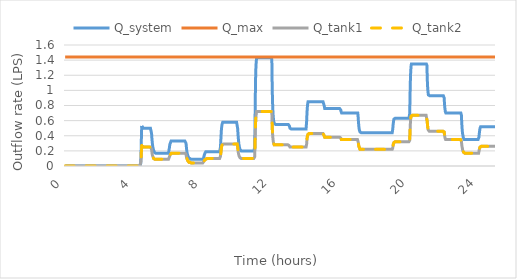
| Category | Q_system | Q_max | Q_tank1 | Q_tank2 |
|---|---|---|---|---|
| 0.0 | 0 | 1.44 | 0 | 0 |
| 0.016666666666666666 | 0 | 1.44 | 0 | 0 |
| 0.03333333333333333 | 0 | 1.44 | 0 | 0 |
| 0.05 | 0 | 1.44 | 0 | 0 |
| 0.06666666666666667 | 0 | 1.44 | 0 | 0 |
| 0.08333333333333333 | 0 | 1.44 | 0 | 0 |
| 0.09999999999999999 | 0 | 1.44 | 0 | 0 |
| 0.11666666666666665 | 0 | 1.44 | 0 | 0 |
| 0.13333333333333333 | 0 | 1.44 | 0 | 0 |
| 0.15 | 0 | 1.44 | 0 | 0 |
| 0.16666666666666666 | 0 | 1.44 | 0 | 0 |
| 0.18333333333333332 | 0 | 1.44 | 0 | 0 |
| 0.19999999999999998 | 0 | 1.44 | 0 | 0 |
| 0.21666666666666665 | 0 | 1.44 | 0 | 0 |
| 0.2333333333333333 | 0 | 1.44 | 0 | 0 |
| 0.24999999999999997 | 0 | 1.44 | 0 | 0 |
| 0.26666666666666666 | 0 | 1.44 | 0 | 0 |
| 0.2833333333333333 | 0 | 1.44 | 0 | 0 |
| 0.3 | 0 | 1.44 | 0 | 0 |
| 0.31666666666666665 | 0 | 1.44 | 0 | 0 |
| 0.3333333333333333 | 0 | 1.44 | 0 | 0 |
| 0.35 | 0 | 1.44 | 0 | 0 |
| 0.36666666666666664 | 0 | 1.44 | 0 | 0 |
| 0.3833333333333333 | 0 | 1.44 | 0 | 0 |
| 0.39999999999999997 | 0 | 1.44 | 0 | 0 |
| 0.41666666666666663 | 0 | 1.44 | 0 | 0 |
| 0.4333333333333333 | 0 | 1.44 | 0 | 0 |
| 0.44999999999999996 | 0 | 1.44 | 0 | 0 |
| 0.4666666666666666 | 0 | 1.44 | 0 | 0 |
| 0.4833333333333333 | 0 | 1.44 | 0 | 0 |
| 0.49999999999999994 | 0 | 1.44 | 0 | 0 |
| 0.5166666666666666 | 0 | 1.44 | 0 | 0 |
| 0.5333333333333333 | 0 | 1.44 | 0 | 0 |
| 0.55 | 0 | 1.44 | 0 | 0 |
| 0.5666666666666668 | 0 | 1.44 | 0 | 0 |
| 0.5833333333333335 | 0 | 1.44 | 0 | 0 |
| 0.6000000000000002 | 0 | 1.44 | 0 | 0 |
| 0.6166666666666669 | 0 | 1.44 | 0 | 0 |
| 0.6333333333333336 | 0 | 1.44 | 0 | 0 |
| 0.6500000000000004 | 0 | 1.44 | 0 | 0 |
| 0.6666666666666671 | 0 | 1.44 | 0 | 0 |
| 0.6833333333333338 | 0 | 1.44 | 0 | 0 |
| 0.7000000000000005 | 0 | 1.44 | 0 | 0 |
| 0.7166666666666672 | 0 | 1.44 | 0 | 0 |
| 0.733333333333334 | 0 | 1.44 | 0 | 0 |
| 0.7500000000000007 | 0 | 1.44 | 0 | 0 |
| 0.7666666666666674 | 0 | 1.44 | 0 | 0 |
| 0.7833333333333341 | 0 | 1.44 | 0 | 0 |
| 0.8000000000000008 | 0 | 1.44 | 0 | 0 |
| 0.8166666666666675 | 0 | 1.44 | 0 | 0 |
| 0.8333333333333343 | 0 | 1.44 | 0 | 0 |
| 0.850000000000001 | 0 | 1.44 | 0 | 0 |
| 0.8666666666666677 | 0 | 1.44 | 0 | 0 |
| 0.8833333333333344 | 0 | 1.44 | 0 | 0 |
| 0.9000000000000011 | 0 | 1.44 | 0 | 0 |
| 0.9166666666666679 | 0 | 1.44 | 0 | 0 |
| 0.9333333333333346 | 0 | 1.44 | 0 | 0 |
| 0.9500000000000013 | 0 | 1.44 | 0 | 0 |
| 0.966666666666668 | 0 | 1.44 | 0 | 0 |
| 0.9833333333333347 | 0 | 1.44 | 0 | 0 |
| 1.0000000000000013 | 0 | 1.44 | 0 | 0 |
| 1.016666666666668 | 0 | 1.44 | 0 | 0 |
| 1.0333333333333345 | 0 | 1.44 | 0 | 0 |
| 1.0500000000000012 | 0 | 1.44 | 0 | 0 |
| 1.0666666666666678 | 0 | 1.44 | 0 | 0 |
| 1.0833333333333344 | 0 | 1.44 | 0 | 0 |
| 1.100000000000001 | 0 | 1.44 | 0 | 0 |
| 1.1166666666666676 | 0 | 1.44 | 0 | 0 |
| 1.1333333333333342 | 0 | 1.44 | 0 | 0 |
| 1.1500000000000008 | 0 | 1.44 | 0 | 0 |
| 1.1666666666666674 | 0 | 1.44 | 0 | 0 |
| 1.183333333333334 | 0 | 1.44 | 0 | 0 |
| 1.2000000000000006 | 0 | 1.44 | 0 | 0 |
| 1.2166666666666672 | 0 | 1.44 | 0 | 0 |
| 1.2333333333333338 | 0 | 1.44 | 0 | 0 |
| 1.2500000000000004 | 0 | 1.44 | 0 | 0 |
| 1.266666666666667 | 0 | 1.44 | 0 | 0 |
| 1.2833333333333337 | 0 | 1.44 | 0 | 0 |
| 1.3000000000000003 | 0 | 1.44 | 0 | 0 |
| 1.3166666666666669 | 0 | 1.44 | 0 | 0 |
| 1.3333333333333335 | 0 | 1.44 | 0 | 0 |
| 1.35 | 0 | 1.44 | 0 | 0 |
| 1.3666666666666667 | 0 | 1.44 | 0 | 0 |
| 1.3833333333333333 | 0 | 1.44 | 0 | 0 |
| 1.4 | 0 | 1.44 | 0 | 0 |
| 1.4166666666666665 | 0 | 1.44 | 0 | 0 |
| 1.4333333333333331 | 0 | 1.44 | 0 | 0 |
| 1.4499999999999997 | 0 | 1.44 | 0 | 0 |
| 1.4666666666666663 | 0 | 1.44 | 0 | 0 |
| 1.483333333333333 | 0 | 1.44 | 0 | 0 |
| 1.4999999999999996 | 0 | 1.44 | 0 | 0 |
| 1.5166666666666662 | 0 | 1.44 | 0 | 0 |
| 1.5333333333333328 | 0 | 1.44 | 0 | 0 |
| 1.5499999999999994 | 0 | 1.44 | 0 | 0 |
| 1.566666666666666 | 0 | 1.44 | 0 | 0 |
| 1.5833333333333326 | 0 | 1.44 | 0 | 0 |
| 1.5999999999999992 | 0 | 1.44 | 0 | 0 |
| 1.6166666666666658 | 0 | 1.44 | 0 | 0 |
| 1.6333333333333324 | 0 | 1.44 | 0 | 0 |
| 1.649999999999999 | 0 | 1.44 | 0 | 0 |
| 1.6666666666666656 | 0 | 1.44 | 0 | 0 |
| 1.6833333333333322 | 0 | 1.44 | 0 | 0 |
| 1.6999999999999988 | 0 | 1.44 | 0 | 0 |
| 1.7166666666666655 | 0 | 1.44 | 0 | 0 |
| 1.733333333333332 | 0 | 1.44 | 0 | 0 |
| 1.7499999999999987 | 0 | 1.44 | 0 | 0 |
| 1.7666666666666653 | 0 | 1.44 | 0 | 0 |
| 1.7833333333333319 | 0 | 1.44 | 0 | 0 |
| 1.7999999999999985 | 0 | 1.44 | 0 | 0 |
| 1.816666666666665 | 0 | 1.44 | 0 | 0 |
| 1.8333333333333317 | 0 | 1.44 | 0 | 0 |
| 1.8499999999999983 | 0 | 1.44 | 0 | 0 |
| 1.866666666666665 | 0 | 1.44 | 0 | 0 |
| 1.8833333333333315 | 0 | 1.44 | 0 | 0 |
| 1.8999999999999981 | 0 | 1.44 | 0 | 0 |
| 1.9166666666666647 | 0 | 1.44 | 0 | 0 |
| 1.9333333333333313 | 0 | 1.44 | 0 | 0 |
| 1.949999999999998 | 0 | 1.44 | 0 | 0 |
| 1.9666666666666646 | 0 | 1.44 | 0 | 0 |
| 1.9833333333333312 | 0 | 1.44 | 0 | 0 |
| 1.9999999999999978 | 0 | 1.44 | 0 | 0 |
| 2.0166666666666644 | 0 | 1.44 | 0 | 0 |
| 2.033333333333331 | 0 | 1.44 | 0 | 0 |
| 2.0499999999999976 | 0 | 1.44 | 0 | 0 |
| 2.066666666666664 | 0 | 1.44 | 0 | 0 |
| 2.083333333333331 | 0 | 1.44 | 0 | 0 |
| 2.0999999999999974 | 0 | 1.44 | 0 | 0 |
| 2.116666666666664 | 0 | 1.44 | 0 | 0 |
| 2.1333333333333306 | 0 | 1.44 | 0 | 0 |
| 2.1499999999999972 | 0 | 1.44 | 0 | 0 |
| 2.166666666666664 | 0 | 1.44 | 0 | 0 |
| 2.1833333333333305 | 0 | 1.44 | 0 | 0 |
| 2.199999999999997 | 0 | 1.44 | 0 | 0 |
| 2.2166666666666637 | 0 | 1.44 | 0 | 0 |
| 2.2333333333333303 | 0 | 1.44 | 0 | 0 |
| 2.249999999999997 | 0 | 1.44 | 0 | 0 |
| 2.2666666666666635 | 0 | 1.44 | 0 | 0 |
| 2.28333333333333 | 0 | 1.44 | 0 | 0 |
| 2.2999999999999967 | 0 | 1.44 | 0 | 0 |
| 2.3166666666666633 | 0 | 1.44 | 0 | 0 |
| 2.33333333333333 | 0 | 1.44 | 0 | 0 |
| 2.3499999999999965 | 0 | 1.44 | 0 | 0 |
| 2.366666666666663 | 0 | 1.44 | 0 | 0 |
| 2.3833333333333298 | 0 | 1.44 | 0 | 0 |
| 2.3999999999999964 | 0 | 1.44 | 0 | 0 |
| 2.416666666666663 | 0 | 1.44 | 0 | 0 |
| 2.4333333333333296 | 0 | 1.44 | 0 | 0 |
| 2.449999999999996 | 0 | 1.44 | 0 | 0 |
| 2.466666666666663 | 0 | 1.44 | 0 | 0 |
| 2.4833333333333294 | 0 | 1.44 | 0 | 0 |
| 2.499999999999996 | 0 | 1.44 | 0 | 0 |
| 2.5166666666666626 | 0 | 1.44 | 0 | 0 |
| 2.533333333333329 | 0 | 1.44 | 0 | 0 |
| 2.549999999999996 | 0 | 1.44 | 0 | 0 |
| 2.5666666666666624 | 0 | 1.44 | 0 | 0 |
| 2.583333333333329 | 0 | 1.44 | 0 | 0 |
| 2.5999999999999956 | 0 | 1.44 | 0 | 0 |
| 2.6166666666666623 | 0 | 1.44 | 0 | 0 |
| 2.633333333333329 | 0 | 1.44 | 0 | 0 |
| 2.6499999999999955 | 0 | 1.44 | 0 | 0 |
| 2.666666666666662 | 0 | 1.44 | 0 | 0 |
| 2.6833333333333287 | 0 | 1.44 | 0 | 0 |
| 2.6999999999999953 | 0 | 1.44 | 0 | 0 |
| 2.716666666666662 | 0 | 1.44 | 0 | 0 |
| 2.7333333333333285 | 0 | 1.44 | 0 | 0 |
| 2.749999999999995 | 0 | 1.44 | 0 | 0 |
| 2.7666666666666617 | 0 | 1.44 | 0 | 0 |
| 2.7833333333333283 | 0 | 1.44 | 0 | 0 |
| 2.799999999999995 | 0 | 1.44 | 0 | 0 |
| 2.8166666666666615 | 0 | 1.44 | 0 | 0 |
| 2.833333333333328 | 0 | 1.44 | 0 | 0 |
| 2.8499999999999948 | 0 | 1.44 | 0 | 0 |
| 2.8666666666666614 | 0 | 1.44 | 0 | 0 |
| 2.883333333333328 | 0 | 1.44 | 0 | 0 |
| 2.8999999999999946 | 0 | 1.44 | 0 | 0 |
| 2.916666666666661 | 0 | 1.44 | 0 | 0 |
| 2.933333333333328 | 0 | 1.44 | 0 | 0 |
| 2.9499999999999944 | 0 | 1.44 | 0 | 0 |
| 2.966666666666661 | 0 | 1.44 | 0 | 0 |
| 2.9833333333333276 | 0 | 1.44 | 0 | 0 |
| 2.9999999999999942 | 0 | 1.44 | 0 | 0 |
| 3.016666666666661 | 0 | 1.44 | 0 | 0 |
| 3.0333333333333274 | 0 | 1.44 | 0 | 0 |
| 3.049999999999994 | 0 | 1.44 | 0 | 0 |
| 3.0666666666666607 | 0 | 1.44 | 0 | 0 |
| 3.0833333333333273 | 0 | 1.44 | 0 | 0 |
| 3.099999999999994 | 0 | 1.44 | 0 | 0 |
| 3.1166666666666605 | 0 | 1.44 | 0 | 0 |
| 3.133333333333327 | 0 | 1.44 | 0 | 0 |
| 3.1499999999999937 | 0 | 1.44 | 0 | 0 |
| 3.1666666666666603 | 0 | 1.44 | 0 | 0 |
| 3.183333333333327 | 0 | 1.44 | 0 | 0 |
| 3.1999999999999935 | 0 | 1.44 | 0 | 0 |
| 3.21666666666666 | 0 | 1.44 | 0 | 0 |
| 3.2333333333333267 | 0 | 1.44 | 0 | 0 |
| 3.2499999999999933 | 0 | 1.44 | 0 | 0 |
| 3.26666666666666 | 0 | 1.44 | 0 | 0 |
| 3.2833333333333266 | 0 | 1.44 | 0 | 0 |
| 3.299999999999993 | 0 | 1.44 | 0 | 0 |
| 3.3166666666666598 | 0 | 1.44 | 0 | 0 |
| 3.3333333333333264 | 0 | 1.44 | 0 | 0 |
| 3.349999999999993 | 0 | 1.44 | 0 | 0 |
| 3.3666666666666596 | 0 | 1.44 | 0 | 0 |
| 3.383333333333326 | 0 | 1.44 | 0 | 0 |
| 3.399999999999993 | 0 | 1.44 | 0 | 0 |
| 3.4166666666666594 | 0 | 1.44 | 0 | 0 |
| 3.433333333333326 | 0 | 1.44 | 0 | 0 |
| 3.4499999999999926 | 0 | 1.44 | 0 | 0 |
| 3.4666666666666592 | 0 | 1.44 | 0 | 0 |
| 3.483333333333326 | 0 | 1.44 | 0 | 0 |
| 3.4999999999999925 | 0 | 1.44 | 0 | 0 |
| 3.516666666666659 | 0 | 1.44 | 0 | 0 |
| 3.5333333333333257 | 0 | 1.44 | 0 | 0 |
| 3.5499999999999923 | 0 | 1.44 | 0 | 0 |
| 3.566666666666659 | 0 | 1.44 | 0 | 0 |
| 3.5833333333333255 | 0 | 1.44 | 0 | 0 |
| 3.599999999999992 | 0 | 1.44 | 0 | 0 |
| 3.6166666666666587 | 0 | 1.44 | 0 | 0 |
| 3.6333333333333253 | 0 | 1.44 | 0 | 0 |
| 3.649999999999992 | 0 | 1.44 | 0 | 0 |
| 3.6666666666666585 | 0 | 1.44 | 0 | 0 |
| 3.683333333333325 | 0 | 1.44 | 0 | 0 |
| 3.6999999999999917 | 0 | 1.44 | 0 | 0 |
| 3.7166666666666583 | 0 | 1.44 | 0 | 0 |
| 3.733333333333325 | 0 | 1.44 | 0 | 0 |
| 3.7499999999999916 | 0 | 1.44 | 0 | 0 |
| 3.766666666666658 | 0 | 1.44 | 0 | 0 |
| 3.7833333333333248 | 0 | 1.44 | 0 | 0 |
| 3.7999999999999914 | 0 | 1.44 | 0 | 0 |
| 3.816666666666658 | 0 | 1.44 | 0 | 0 |
| 3.8333333333333246 | 0 | 1.44 | 0 | 0 |
| 3.849999999999991 | 0 | 1.44 | 0 | 0 |
| 3.866666666666658 | 0 | 1.44 | 0 | 0 |
| 3.8833333333333244 | 0 | 1.44 | 0 | 0 |
| 3.899999999999991 | 0 | 1.44 | 0 | 0 |
| 3.9166666666666576 | 0 | 1.44 | 0 | 0 |
| 3.9333333333333242 | 0 | 1.44 | 0 | 0 |
| 3.949999999999991 | 0 | 1.44 | 0 | 0 |
| 3.9666666666666575 | 0 | 1.44 | 0 | 0 |
| 3.983333333333324 | 0 | 1.44 | 0 | 0 |
| 3.9999999999999907 | 0 | 1.44 | 0 | 0 |
| 4.016666666666658 | 0 | 1.44 | 0 | 0 |
| 4.033333333333324 | 0 | 1.44 | 0 | 0 |
| 4.049999999999991 | 0 | 1.44 | 0 | 0 |
| 4.0666666666666575 | 0 | 1.44 | 0 | 0 |
| 4.083333333333324 | 0 | 1.44 | 0 | 0 |
| 4.099999999999991 | 0 | 1.44 | 0 | 0 |
| 4.116666666666657 | 0 | 1.44 | 0 | 0 |
| 4.133333333333324 | 0 | 1.44 | 0 | 0 |
| 4.149999999999991 | 0 | 1.44 | 0 | 0 |
| 4.166666666666657 | 0 | 1.44 | 0 | 0 |
| 4.183333333333324 | 0 | 1.44 | 0 | 0 |
| 4.19999999999999 | 0 | 1.44 | 0 | 0 |
| 4.216666666666657 | 0 | 1.44 | 0 | 0 |
| 4.233333333333324 | 0 | 1.44 | 0 | 0 |
| 4.24999999999999 | 0 | 1.44 | 0 | 0 |
| 4.266666666666657 | 0 | 1.44 | 0 | 0 |
| 4.2833333333333234 | 0 | 1.44 | 0 | 0 |
| 4.29999999999999 | 0 | 1.44 | 0 | 0 |
| 4.316666666666657 | 0 | 1.44 | 0 | 0 |
| 4.333333333333323 | 0 | 1.44 | 0 | 0 |
| 4.34999999999999 | 0 | 1.44 | 0 | 0 |
| 4.3666666666666565 | 0 | 1.44 | 0 | 0 |
| 4.383333333333323 | 0.03 | 1.44 | 0.01 | 0.01 |
| 4.39999999999999 | 0.11 | 1.44 | 0.06 | 0.06 |
| 4.416666666666656 | 0.27 | 1.44 | 0.14 | 0.14 |
| 4.433333333333323 | 0.45 | 1.44 | 0.23 | 0.23 |
| 4.4499999999999895 | 0.53 | 1.44 | 0.27 | 0.27 |
| 4.466666666666656 | 0.52 | 1.44 | 0.26 | 0.26 |
| 4.483333333333323 | 0.51 | 1.44 | 0.25 | 0.25 |
| 4.499999999999989 | 0.5 | 1.44 | 0.25 | 0.25 |
| 4.516666666666656 | 0.5 | 1.44 | 0.25 | 0.25 |
| 4.533333333333323 | 0.5 | 1.44 | 0.25 | 0.25 |
| 4.549999999999989 | 0.5 | 1.44 | 0.25 | 0.25 |
| 4.566666666666656 | 0.5 | 1.44 | 0.25 | 0.25 |
| 4.583333333333322 | 0.5 | 1.44 | 0.25 | 0.25 |
| 4.599999999999989 | 0.5 | 1.44 | 0.25 | 0.25 |
| 4.616666666666656 | 0.5 | 1.44 | 0.25 | 0.25 |
| 4.633333333333322 | 0.5 | 1.44 | 0.25 | 0.25 |
| 4.649999999999989 | 0.5 | 1.44 | 0.25 | 0.25 |
| 4.666666666666655 | 0.5 | 1.44 | 0.25 | 0.25 |
| 4.683333333333322 | 0.5 | 1.44 | 0.25 | 0.25 |
| 4.699999999999989 | 0.5 | 1.44 | 0.25 | 0.25 |
| 4.716666666666655 | 0.5 | 1.44 | 0.25 | 0.25 |
| 4.733333333333322 | 0.5 | 1.44 | 0.25 | 0.25 |
| 4.7499999999999885 | 0.5 | 1.44 | 0.25 | 0.25 |
| 4.766666666666655 | 0.5 | 1.44 | 0.25 | 0.25 |
| 4.783333333333322 | 0.5 | 1.44 | 0.25 | 0.25 |
| 4.799999999999988 | 0.5 | 1.44 | 0.25 | 0.25 |
| 4.816666666666655 | 0.5 | 1.44 | 0.25 | 0.25 |
| 4.8333333333333215 | 0.5 | 1.44 | 0.25 | 0.25 |
| 4.849999999999988 | 0.5 | 1.44 | 0.25 | 0.25 |
| 4.866666666666655 | 0.5 | 1.44 | 0.25 | 0.25 |
| 4.883333333333321 | 0.5 | 1.44 | 0.25 | 0.25 |
| 4.899999999999988 | 0.5 | 1.44 | 0.25 | 0.25 |
| 4.9166666666666545 | 0.5 | 1.44 | 0.25 | 0.25 |
| 4.933333333333321 | 0.5 | 1.44 | 0.25 | 0.25 |
| 4.949999999999988 | 0.5 | 1.44 | 0.25 | 0.25 |
| 4.966666666666654 | 0.5 | 1.44 | 0.25 | 0.25 |
| 4.983333333333321 | 0.5 | 1.44 | 0.25 | 0.25 |
| 4.999999999999988 | 0.49 | 1.44 | 0.25 | 0.25 |
| 5.016666666666654 | 0.43 | 1.44 | 0.22 | 0.22 |
| 5.033333333333321 | 0.37 | 1.44 | 0.19 | 0.19 |
| 5.049999999999987 | 0.33 | 1.44 | 0.16 | 0.16 |
| 5.066666666666654 | 0.29 | 1.44 | 0.14 | 0.14 |
| 5.083333333333321 | 0.26 | 1.44 | 0.13 | 0.13 |
| 5.099999999999987 | 0.24 | 1.44 | 0.12 | 0.12 |
| 5.116666666666654 | 0.22 | 1.44 | 0.11 | 0.11 |
| 5.13333333333332 | 0.21 | 1.44 | 0.1 | 0.1 |
| 5.149999999999987 | 0.2 | 1.44 | 0.1 | 0.1 |
| 5.166666666666654 | 0.19 | 1.44 | 0.09 | 0.09 |
| 5.18333333333332 | 0.18 | 1.44 | 0.09 | 0.09 |
| 5.199999999999987 | 0.18 | 1.44 | 0.09 | 0.09 |
| 5.2166666666666535 | 0.18 | 1.44 | 0.09 | 0.09 |
| 5.23333333333332 | 0.17 | 1.44 | 0.09 | 0.09 |
| 5.249999999999987 | 0.17 | 1.44 | 0.09 | 0.09 |
| 5.266666666666653 | 0.17 | 1.44 | 0.09 | 0.09 |
| 5.28333333333332 | 0.17 | 1.44 | 0.09 | 0.09 |
| 5.2999999999999865 | 0.17 | 1.44 | 0.09 | 0.09 |
| 5.316666666666653 | 0.17 | 1.44 | 0.09 | 0.09 |
| 5.33333333333332 | 0.17 | 1.44 | 0.09 | 0.09 |
| 5.349999999999986 | 0.17 | 1.44 | 0.09 | 0.09 |
| 5.366666666666653 | 0.17 | 1.44 | 0.09 | 0.09 |
| 5.3833333333333195 | 0.17 | 1.44 | 0.09 | 0.09 |
| 5.399999999999986 | 0.17 | 1.44 | 0.09 | 0.09 |
| 5.416666666666653 | 0.17 | 1.44 | 0.09 | 0.09 |
| 5.433333333333319 | 0.17 | 1.44 | 0.09 | 0.09 |
| 5.449999999999986 | 0.17 | 1.44 | 0.09 | 0.09 |
| 5.466666666666653 | 0.17 | 1.44 | 0.09 | 0.09 |
| 5.483333333333319 | 0.17 | 1.44 | 0.09 | 0.09 |
| 5.499999999999986 | 0.17 | 1.44 | 0.09 | 0.09 |
| 5.516666666666652 | 0.17 | 1.44 | 0.09 | 0.09 |
| 5.533333333333319 | 0.17 | 1.44 | 0.09 | 0.09 |
| 5.549999999999986 | 0.17 | 1.44 | 0.09 | 0.09 |
| 5.566666666666652 | 0.17 | 1.44 | 0.09 | 0.09 |
| 5.583333333333319 | 0.17 | 1.44 | 0.09 | 0.09 |
| 5.599999999999985 | 0.17 | 1.44 | 0.09 | 0.09 |
| 5.616666666666652 | 0.17 | 1.44 | 0.09 | 0.09 |
| 5.633333333333319 | 0.17 | 1.44 | 0.09 | 0.09 |
| 5.649999999999985 | 0.17 | 1.44 | 0.09 | 0.09 |
| 5.666666666666652 | 0.17 | 1.44 | 0.09 | 0.09 |
| 5.6833333333333185 | 0.17 | 1.44 | 0.09 | 0.09 |
| 5.699999999999985 | 0.17 | 1.44 | 0.09 | 0.09 |
| 5.716666666666652 | 0.17 | 1.44 | 0.09 | 0.09 |
| 5.733333333333318 | 0.17 | 1.44 | 0.09 | 0.09 |
| 5.749999999999985 | 0.17 | 1.44 | 0.09 | 0.09 |
| 5.7666666666666515 | 0.17 | 1.44 | 0.09 | 0.09 |
| 5.783333333333318 | 0.17 | 1.44 | 0.09 | 0.09 |
| 5.799999999999985 | 0.17 | 1.44 | 0.09 | 0.09 |
| 5.816666666666651 | 0.17 | 1.44 | 0.09 | 0.09 |
| 5.833333333333318 | 0.17 | 1.44 | 0.09 | 0.09 |
| 5.8499999999999845 | 0.17 | 1.44 | 0.09 | 0.09 |
| 5.866666666666651 | 0.17 | 1.44 | 0.09 | 0.09 |
| 5.883333333333318 | 0.17 | 1.44 | 0.09 | 0.09 |
| 5.899999999999984 | 0.17 | 1.44 | 0.09 | 0.09 |
| 5.916666666666651 | 0.17 | 1.44 | 0.09 | 0.09 |
| 5.933333333333318 | 0.17 | 1.44 | 0.09 | 0.09 |
| 5.949999999999984 | 0.17 | 1.44 | 0.09 | 0.09 |
| 5.966666666666651 | 0.17 | 1.44 | 0.09 | 0.09 |
| 5.983333333333317 | 0.17 | 1.44 | 0.09 | 0.09 |
| 5.999999999999984 | 0.17 | 1.44 | 0.09 | 0.09 |
| 6.016666666666651 | 0.19 | 1.44 | 0.1 | 0.1 |
| 6.033333333333317 | 0.22 | 1.44 | 0.11 | 0.11 |
| 6.049999999999984 | 0.24 | 1.44 | 0.12 | 0.12 |
| 6.06666666666665 | 0.27 | 1.44 | 0.13 | 0.13 |
| 6.083333333333317 | 0.29 | 1.44 | 0.14 | 0.14 |
| 6.099999999999984 | 0.3 | 1.44 | 0.15 | 0.15 |
| 6.11666666666665 | 0.31 | 1.44 | 0.16 | 0.16 |
| 6.133333333333317 | 0.32 | 1.44 | 0.16 | 0.16 |
| 6.1499999999999835 | 0.33 | 1.44 | 0.16 | 0.16 |
| 6.16666666666665 | 0.33 | 1.44 | 0.17 | 0.17 |
| 6.183333333333317 | 0.33 | 1.44 | 0.17 | 0.17 |
| 6.199999999999983 | 0.33 | 1.44 | 0.17 | 0.17 |
| 6.21666666666665 | 0.33 | 1.44 | 0.17 | 0.17 |
| 6.2333333333333165 | 0.33 | 1.44 | 0.17 | 0.17 |
| 6.249999999999983 | 0.33 | 1.44 | 0.17 | 0.17 |
| 6.26666666666665 | 0.33 | 1.44 | 0.17 | 0.17 |
| 6.283333333333316 | 0.33 | 1.44 | 0.17 | 0.17 |
| 6.299999999999983 | 0.33 | 1.44 | 0.17 | 0.17 |
| 6.3166666666666496 | 0.33 | 1.44 | 0.17 | 0.17 |
| 6.333333333333316 | 0.33 | 1.44 | 0.17 | 0.17 |
| 6.349999999999983 | 0.33 | 1.44 | 0.17 | 0.17 |
| 6.366666666666649 | 0.33 | 1.44 | 0.17 | 0.17 |
| 6.383333333333316 | 0.33 | 1.44 | 0.17 | 0.17 |
| 6.399999999999983 | 0.33 | 1.44 | 0.17 | 0.17 |
| 6.416666666666649 | 0.33 | 1.44 | 0.17 | 0.17 |
| 6.433333333333316 | 0.33 | 1.44 | 0.17 | 0.17 |
| 6.449999999999982 | 0.33 | 1.44 | 0.17 | 0.17 |
| 6.466666666666649 | 0.33 | 1.44 | 0.17 | 0.17 |
| 6.483333333333316 | 0.33 | 1.44 | 0.17 | 0.17 |
| 6.499999999999982 | 0.33 | 1.44 | 0.17 | 0.17 |
| 6.516666666666649 | 0.33 | 1.44 | 0.17 | 0.17 |
| 6.5333333333333155 | 0.33 | 1.44 | 0.17 | 0.17 |
| 6.549999999999982 | 0.33 | 1.44 | 0.17 | 0.17 |
| 6.566666666666649 | 0.33 | 1.44 | 0.17 | 0.17 |
| 6.583333333333315 | 0.33 | 1.44 | 0.17 | 0.17 |
| 6.599999999999982 | 0.33 | 1.44 | 0.17 | 0.17 |
| 6.6166666666666485 | 0.33 | 1.44 | 0.17 | 0.17 |
| 6.633333333333315 | 0.33 | 1.44 | 0.17 | 0.17 |
| 6.649999999999982 | 0.33 | 1.44 | 0.17 | 0.17 |
| 6.666666666666648 | 0.33 | 1.44 | 0.17 | 0.17 |
| 6.683333333333315 | 0.33 | 1.44 | 0.17 | 0.17 |
| 6.6999999999999815 | 0.33 | 1.44 | 0.17 | 0.17 |
| 6.716666666666648 | 0.33 | 1.44 | 0.17 | 0.17 |
| 6.733333333333315 | 0.33 | 1.44 | 0.17 | 0.17 |
| 6.749999999999981 | 0.33 | 1.44 | 0.17 | 0.17 |
| 6.766666666666648 | 0.33 | 1.44 | 0.17 | 0.17 |
| 6.783333333333315 | 0.33 | 1.44 | 0.17 | 0.17 |
| 6.799999999999981 | 0.33 | 1.44 | 0.17 | 0.17 |
| 6.816666666666648 | 0.33 | 1.44 | 0.17 | 0.17 |
| 6.833333333333314 | 0.33 | 1.44 | 0.17 | 0.17 |
| 6.849999999999981 | 0.33 | 1.44 | 0.17 | 0.17 |
| 6.866666666666648 | 0.33 | 1.44 | 0.17 | 0.17 |
| 6.883333333333314 | 0.33 | 1.44 | 0.17 | 0.17 |
| 6.899999999999981 | 0.33 | 1.44 | 0.17 | 0.17 |
| 6.916666666666647 | 0.33 | 1.44 | 0.17 | 0.17 |
| 6.933333333333314 | 0.33 | 1.44 | 0.17 | 0.17 |
| 6.949999999999981 | 0.33 | 1.44 | 0.17 | 0.17 |
| 6.966666666666647 | 0.33 | 1.44 | 0.17 | 0.17 |
| 6.983333333333314 | 0.33 | 1.44 | 0.17 | 0.17 |
| 6.9999999999999805 | 0.33 | 1.44 | 0.16 | 0.16 |
| 7.016666666666647 | 0.3 | 1.44 | 0.15 | 0.15 |
| 7.033333333333314 | 0.26 | 1.44 | 0.13 | 0.13 |
| 7.04999999999998 | 0.22 | 1.44 | 0.11 | 0.11 |
| 7.066666666666647 | 0.19 | 1.44 | 0.1 | 0.1 |
| 7.0833333333333135 | 0.17 | 1.44 | 0.09 | 0.09 |
| 7.09999999999998 | 0.15 | 1.44 | 0.08 | 0.08 |
| 7.116666666666647 | 0.14 | 1.44 | 0.07 | 0.07 |
| 7.133333333333313 | 0.13 | 1.44 | 0.06 | 0.06 |
| 7.14999999999998 | 0.12 | 1.44 | 0.06 | 0.06 |
| 7.1666666666666465 | 0.11 | 1.44 | 0.06 | 0.06 |
| 7.183333333333313 | 0.11 | 1.44 | 0.05 | 0.05 |
| 7.19999999999998 | 0.1 | 1.44 | 0.05 | 0.05 |
| 7.216666666666646 | 0.1 | 1.44 | 0.05 | 0.05 |
| 7.233333333333313 | 0.1 | 1.44 | 0.05 | 0.05 |
| 7.24999999999998 | 0.09 | 1.44 | 0.05 | 0.05 |
| 7.266666666666646 | 0.09 | 1.44 | 0.05 | 0.05 |
| 7.283333333333313 | 0.09 | 1.44 | 0.05 | 0.05 |
| 7.299999999999979 | 0.09 | 1.44 | 0.04 | 0.04 |
| 7.316666666666646 | 0.09 | 1.44 | 0.04 | 0.04 |
| 7.333333333333313 | 0.09 | 1.44 | 0.04 | 0.04 |
| 7.349999999999979 | 0.09 | 1.44 | 0.04 | 0.04 |
| 7.366666666666646 | 0.09 | 1.44 | 0.04 | 0.04 |
| 7.383333333333312 | 0.09 | 1.44 | 0.04 | 0.04 |
| 7.399999999999979 | 0.09 | 1.44 | 0.04 | 0.04 |
| 7.416666666666646 | 0.09 | 1.44 | 0.04 | 0.04 |
| 7.433333333333312 | 0.09 | 1.44 | 0.04 | 0.04 |
| 7.449999999999979 | 0.09 | 1.44 | 0.04 | 0.04 |
| 7.4666666666666455 | 0.09 | 1.44 | 0.04 | 0.04 |
| 7.483333333333312 | 0.09 | 1.44 | 0.04 | 0.04 |
| 7.499999999999979 | 0.09 | 1.44 | 0.04 | 0.04 |
| 7.516666666666645 | 0.09 | 1.44 | 0.04 | 0.04 |
| 7.533333333333312 | 0.09 | 1.44 | 0.04 | 0.04 |
| 7.5499999999999785 | 0.09 | 1.44 | 0.04 | 0.04 |
| 7.566666666666645 | 0.09 | 1.44 | 0.04 | 0.04 |
| 7.583333333333312 | 0.09 | 1.44 | 0.04 | 0.04 |
| 7.599999999999978 | 0.09 | 1.44 | 0.04 | 0.04 |
| 7.616666666666645 | 0.09 | 1.44 | 0.04 | 0.04 |
| 7.6333333333333115 | 0.09 | 1.44 | 0.04 | 0.04 |
| 7.649999999999978 | 0.09 | 1.44 | 0.04 | 0.04 |
| 7.666666666666645 | 0.09 | 1.44 | 0.04 | 0.04 |
| 7.683333333333311 | 0.09 | 1.44 | 0.04 | 0.04 |
| 7.699999999999978 | 0.09 | 1.44 | 0.04 | 0.04 |
| 7.716666666666645 | 0.09 | 1.44 | 0.04 | 0.04 |
| 7.733333333333311 | 0.09 | 1.44 | 0.04 | 0.04 |
| 7.749999999999978 | 0.09 | 1.44 | 0.04 | 0.04 |
| 7.766666666666644 | 0.09 | 1.44 | 0.04 | 0.04 |
| 7.783333333333311 | 0.09 | 1.44 | 0.04 | 0.04 |
| 7.799999999999978 | 0.09 | 1.44 | 0.04 | 0.04 |
| 7.816666666666644 | 0.09 | 1.44 | 0.04 | 0.04 |
| 7.833333333333311 | 0.09 | 1.44 | 0.04 | 0.04 |
| 7.849999999999977 | 0.09 | 1.44 | 0.04 | 0.04 |
| 7.866666666666644 | 0.09 | 1.44 | 0.04 | 0.04 |
| 7.883333333333311 | 0.09 | 1.44 | 0.04 | 0.04 |
| 7.899999999999977 | 0.09 | 1.44 | 0.04 | 0.04 |
| 7.916666666666644 | 0.09 | 1.44 | 0.04 | 0.04 |
| 7.9333333333333105 | 0.09 | 1.44 | 0.04 | 0.04 |
| 7.949999999999977 | 0.09 | 1.44 | 0.04 | 0.04 |
| 7.966666666666644 | 0.09 | 1.44 | 0.04 | 0.04 |
| 7.98333333333331 | 0.09 | 1.44 | 0.04 | 0.04 |
| 7.999999999999977 | 0.09 | 1.44 | 0.04 | 0.04 |
| 8.016666666666644 | 0.09 | 1.44 | 0.05 | 0.05 |
| 8.033333333333312 | 0.1 | 1.44 | 0.05 | 0.05 |
| 8.04999999999998 | 0.12 | 1.44 | 0.06 | 0.06 |
| 8.066666666666647 | 0.13 | 1.44 | 0.07 | 0.07 |
| 8.083333333333314 | 0.15 | 1.44 | 0.07 | 0.07 |
| 8.099999999999982 | 0.16 | 1.44 | 0.08 | 0.08 |
| 8.11666666666665 | 0.17 | 1.44 | 0.08 | 0.08 |
| 8.133333333333317 | 0.18 | 1.44 | 0.09 | 0.09 |
| 8.149999999999984 | 0.18 | 1.44 | 0.09 | 0.09 |
| 8.166666666666652 | 0.19 | 1.44 | 0.09 | 0.09 |
| 8.18333333333332 | 0.19 | 1.44 | 0.09 | 0.09 |
| 8.199999999999987 | 0.19 | 1.44 | 0.1 | 0.1 |
| 8.216666666666654 | 0.19 | 1.44 | 0.1 | 0.1 |
| 8.233333333333322 | 0.19 | 1.44 | 0.1 | 0.1 |
| 8.24999999999999 | 0.19 | 1.44 | 0.1 | 0.1 |
| 8.266666666666657 | 0.19 | 1.44 | 0.1 | 0.1 |
| 8.283333333333324 | 0.19 | 1.44 | 0.1 | 0.1 |
| 8.299999999999992 | 0.19 | 1.44 | 0.1 | 0.1 |
| 8.31666666666666 | 0.19 | 1.44 | 0.1 | 0.1 |
| 8.333333333333327 | 0.19 | 1.44 | 0.1 | 0.1 |
| 8.349999999999994 | 0.19 | 1.44 | 0.1 | 0.1 |
| 8.366666666666662 | 0.19 | 1.44 | 0.1 | 0.1 |
| 8.38333333333333 | 0.19 | 1.44 | 0.1 | 0.1 |
| 8.399999999999997 | 0.19 | 1.44 | 0.1 | 0.1 |
| 8.416666666666664 | 0.19 | 1.44 | 0.1 | 0.1 |
| 8.433333333333332 | 0.19 | 1.44 | 0.1 | 0.1 |
| 8.45 | 0.19 | 1.44 | 0.1 | 0.1 |
| 8.466666666666667 | 0.19 | 1.44 | 0.1 | 0.1 |
| 8.483333333333334 | 0.19 | 1.44 | 0.1 | 0.1 |
| 8.500000000000002 | 0.19 | 1.44 | 0.1 | 0.1 |
| 8.51666666666667 | 0.19 | 1.44 | 0.1 | 0.1 |
| 8.533333333333337 | 0.19 | 1.44 | 0.1 | 0.1 |
| 8.550000000000004 | 0.19 | 1.44 | 0.1 | 0.1 |
| 8.566666666666672 | 0.19 | 1.44 | 0.1 | 0.1 |
| 8.58333333333334 | 0.19 | 1.44 | 0.1 | 0.1 |
| 8.600000000000007 | 0.19 | 1.44 | 0.1 | 0.1 |
| 8.616666666666674 | 0.19 | 1.44 | 0.1 | 0.1 |
| 8.633333333333342 | 0.19 | 1.44 | 0.1 | 0.1 |
| 8.65000000000001 | 0.19 | 1.44 | 0.1 | 0.1 |
| 8.666666666666677 | 0.19 | 1.44 | 0.1 | 0.1 |
| 8.683333333333344 | 0.19 | 1.44 | 0.1 | 0.1 |
| 8.700000000000012 | 0.19 | 1.44 | 0.1 | 0.1 |
| 8.71666666666668 | 0.19 | 1.44 | 0.1 | 0.1 |
| 8.733333333333347 | 0.19 | 1.44 | 0.1 | 0.1 |
| 8.750000000000014 | 0.19 | 1.44 | 0.1 | 0.1 |
| 8.766666666666682 | 0.19 | 1.44 | 0.1 | 0.1 |
| 8.78333333333335 | 0.19 | 1.44 | 0.1 | 0.1 |
| 8.800000000000017 | 0.19 | 1.44 | 0.1 | 0.1 |
| 8.816666666666684 | 0.19 | 1.44 | 0.1 | 0.1 |
| 8.833333333333352 | 0.19 | 1.44 | 0.1 | 0.1 |
| 8.85000000000002 | 0.19 | 1.44 | 0.1 | 0.1 |
| 8.866666666666687 | 0.19 | 1.44 | 0.1 | 0.1 |
| 8.883333333333354 | 0.19 | 1.44 | 0.1 | 0.1 |
| 8.900000000000022 | 0.19 | 1.44 | 0.1 | 0.1 |
| 8.91666666666669 | 0.19 | 1.44 | 0.1 | 0.1 |
| 8.933333333333357 | 0.19 | 1.44 | 0.1 | 0.1 |
| 8.950000000000024 | 0.19 | 1.44 | 0.1 | 0.1 |
| 8.966666666666692 | 0.19 | 1.44 | 0.1 | 0.1 |
| 8.98333333333336 | 0.19 | 1.44 | 0.1 | 0.1 |
| 9.000000000000027 | 0.2 | 1.44 | 0.1 | 0.1 |
| 9.016666666666694 | 0.25 | 1.44 | 0.13 | 0.13 |
| 9.033333333333362 | 0.33 | 1.44 | 0.16 | 0.16 |
| 9.05000000000003 | 0.4 | 1.44 | 0.2 | 0.2 |
| 9.066666666666697 | 0.47 | 1.44 | 0.23 | 0.23 |
| 9.083333333333364 | 0.51 | 1.44 | 0.26 | 0.26 |
| 9.100000000000032 | 0.54 | 1.44 | 0.27 | 0.27 |
| 9.1166666666667 | 0.56 | 1.44 | 0.28 | 0.28 |
| 9.133333333333367 | 0.57 | 1.44 | 0.28 | 0.28 |
| 9.150000000000034 | 0.58 | 1.44 | 0.29 | 0.29 |
| 9.166666666666702 | 0.58 | 1.44 | 0.29 | 0.29 |
| 9.183333333333369 | 0.58 | 1.44 | 0.29 | 0.29 |
| 9.200000000000037 | 0.58 | 1.44 | 0.29 | 0.29 |
| 9.216666666666704 | 0.58 | 1.44 | 0.29 | 0.29 |
| 9.233333333333372 | 0.58 | 1.44 | 0.29 | 0.29 |
| 9.250000000000039 | 0.58 | 1.44 | 0.29 | 0.29 |
| 9.266666666666707 | 0.58 | 1.44 | 0.29 | 0.29 |
| 9.283333333333374 | 0.58 | 1.44 | 0.29 | 0.29 |
| 9.300000000000042 | 0.58 | 1.44 | 0.29 | 0.29 |
| 9.316666666666709 | 0.58 | 1.44 | 0.29 | 0.29 |
| 9.333333333333377 | 0.58 | 1.44 | 0.29 | 0.29 |
| 9.350000000000044 | 0.58 | 1.44 | 0.29 | 0.29 |
| 9.366666666666712 | 0.58 | 1.44 | 0.29 | 0.29 |
| 9.383333333333379 | 0.58 | 1.44 | 0.29 | 0.29 |
| 9.400000000000047 | 0.58 | 1.44 | 0.29 | 0.29 |
| 9.416666666666714 | 0.58 | 1.44 | 0.29 | 0.29 |
| 9.433333333333382 | 0.58 | 1.44 | 0.29 | 0.29 |
| 9.450000000000049 | 0.58 | 1.44 | 0.29 | 0.29 |
| 9.466666666666717 | 0.58 | 1.44 | 0.29 | 0.29 |
| 9.483333333333384 | 0.58 | 1.44 | 0.29 | 0.29 |
| 9.500000000000052 | 0.58 | 1.44 | 0.29 | 0.29 |
| 9.516666666666719 | 0.58 | 1.44 | 0.29 | 0.29 |
| 9.533333333333387 | 0.58 | 1.44 | 0.29 | 0.29 |
| 9.550000000000054 | 0.58 | 1.44 | 0.29 | 0.29 |
| 9.566666666666721 | 0.58 | 1.44 | 0.29 | 0.29 |
| 9.583333333333389 | 0.58 | 1.44 | 0.29 | 0.29 |
| 9.600000000000056 | 0.58 | 1.44 | 0.29 | 0.29 |
| 9.616666666666724 | 0.58 | 1.44 | 0.29 | 0.29 |
| 9.633333333333391 | 0.58 | 1.44 | 0.29 | 0.29 |
| 9.650000000000059 | 0.58 | 1.44 | 0.29 | 0.29 |
| 9.666666666666726 | 0.58 | 1.44 | 0.29 | 0.29 |
| 9.683333333333394 | 0.58 | 1.44 | 0.29 | 0.29 |
| 9.700000000000061 | 0.58 | 1.44 | 0.29 | 0.29 |
| 9.716666666666729 | 0.58 | 1.44 | 0.29 | 0.29 |
| 9.733333333333396 | 0.58 | 1.44 | 0.29 | 0.29 |
| 9.750000000000064 | 0.58 | 1.44 | 0.29 | 0.29 |
| 9.766666666666731 | 0.58 | 1.44 | 0.29 | 0.29 |
| 9.783333333333399 | 0.58 | 1.44 | 0.29 | 0.29 |
| 9.800000000000066 | 0.58 | 1.44 | 0.29 | 0.29 |
| 9.816666666666734 | 0.58 | 1.44 | 0.29 | 0.29 |
| 9.833333333333401 | 0.58 | 1.44 | 0.29 | 0.29 |
| 9.850000000000069 | 0.58 | 1.44 | 0.29 | 0.29 |
| 9.866666666666736 | 0.58 | 1.44 | 0.29 | 0.29 |
| 9.883333333333404 | 0.58 | 1.44 | 0.29 | 0.29 |
| 9.900000000000071 | 0.58 | 1.44 | 0.29 | 0.29 |
| 9.916666666666739 | 0.58 | 1.44 | 0.29 | 0.29 |
| 9.933333333333406 | 0.58 | 1.44 | 0.29 | 0.29 |
| 9.950000000000074 | 0.58 | 1.44 | 0.29 | 0.29 |
| 9.966666666666741 | 0.58 | 1.44 | 0.29 | 0.29 |
| 9.983333333333409 | 0.58 | 1.44 | 0.29 | 0.29 |
| 10.000000000000076 | 0.57 | 1.44 | 0.28 | 0.28 |
| 10.016666666666744 | 0.49 | 1.44 | 0.25 | 0.25 |
| 10.033333333333411 | 0.42 | 1.44 | 0.21 | 0.21 |
| 10.050000000000079 | 0.37 | 1.44 | 0.18 | 0.18 |
| 10.066666666666746 | 0.33 | 1.44 | 0.16 | 0.16 |
| 10.083333333333414 | 0.29 | 1.44 | 0.15 | 0.15 |
| 10.100000000000081 | 0.27 | 1.44 | 0.13 | 0.13 |
| 10.116666666666749 | 0.25 | 1.44 | 0.13 | 0.13 |
| 10.133333333333416 | 0.24 | 1.44 | 0.12 | 0.12 |
| 10.150000000000084 | 0.22 | 1.44 | 0.11 | 0.11 |
| 10.166666666666751 | 0.22 | 1.44 | 0.11 | 0.11 |
| 10.183333333333419 | 0.21 | 1.44 | 0.11 | 0.11 |
| 10.200000000000086 | 0.21 | 1.44 | 0.1 | 0.1 |
| 10.216666666666754 | 0.2 | 1.44 | 0.1 | 0.1 |
| 10.233333333333421 | 0.2 | 1.44 | 0.1 | 0.1 |
| 10.250000000000089 | 0.2 | 1.44 | 0.1 | 0.1 |
| 10.266666666666756 | 0.2 | 1.44 | 0.1 | 0.1 |
| 10.283333333333424 | 0.2 | 1.44 | 0.1 | 0.1 |
| 10.300000000000091 | 0.2 | 1.44 | 0.1 | 0.1 |
| 10.316666666666759 | 0.2 | 1.44 | 0.1 | 0.1 |
| 10.333333333333426 | 0.2 | 1.44 | 0.1 | 0.1 |
| 10.350000000000094 | 0.2 | 1.44 | 0.1 | 0.1 |
| 10.366666666666761 | 0.2 | 1.44 | 0.1 | 0.1 |
| 10.383333333333429 | 0.2 | 1.44 | 0.1 | 0.1 |
| 10.400000000000096 | 0.2 | 1.44 | 0.1 | 0.1 |
| 10.416666666666764 | 0.2 | 1.44 | 0.1 | 0.1 |
| 10.433333333333431 | 0.2 | 1.44 | 0.1 | 0.1 |
| 10.450000000000099 | 0.2 | 1.44 | 0.1 | 0.1 |
| 10.466666666666766 | 0.2 | 1.44 | 0.1 | 0.1 |
| 10.483333333333434 | 0.2 | 1.44 | 0.1 | 0.1 |
| 10.500000000000101 | 0.2 | 1.44 | 0.1 | 0.1 |
| 10.516666666666769 | 0.2 | 1.44 | 0.1 | 0.1 |
| 10.533333333333436 | 0.2 | 1.44 | 0.1 | 0.1 |
| 10.550000000000104 | 0.2 | 1.44 | 0.1 | 0.1 |
| 10.566666666666771 | 0.2 | 1.44 | 0.1 | 0.1 |
| 10.583333333333439 | 0.2 | 1.44 | 0.1 | 0.1 |
| 10.600000000000106 | 0.2 | 1.44 | 0.1 | 0.1 |
| 10.616666666666774 | 0.2 | 1.44 | 0.1 | 0.1 |
| 10.633333333333441 | 0.2 | 1.44 | 0.1 | 0.1 |
| 10.650000000000109 | 0.2 | 1.44 | 0.1 | 0.1 |
| 10.666666666666776 | 0.2 | 1.44 | 0.1 | 0.1 |
| 10.683333333333444 | 0.2 | 1.44 | 0.1 | 0.1 |
| 10.700000000000111 | 0.2 | 1.44 | 0.1 | 0.1 |
| 10.716666666666779 | 0.2 | 1.44 | 0.1 | 0.1 |
| 10.733333333333446 | 0.2 | 1.44 | 0.1 | 0.1 |
| 10.750000000000114 | 0.2 | 1.44 | 0.1 | 0.1 |
| 10.766666666666781 | 0.2 | 1.44 | 0.1 | 0.1 |
| 10.783333333333449 | 0.2 | 1.44 | 0.1 | 0.1 |
| 10.800000000000116 | 0.2 | 1.44 | 0.1 | 0.1 |
| 10.816666666666784 | 0.2 | 1.44 | 0.1 | 0.1 |
| 10.833333333333451 | 0.2 | 1.44 | 0.1 | 0.1 |
| 10.850000000000119 | 0.2 | 1.44 | 0.1 | 0.1 |
| 10.866666666666786 | 0.2 | 1.44 | 0.1 | 0.1 |
| 10.883333333333454 | 0.2 | 1.44 | 0.1 | 0.1 |
| 10.900000000000121 | 0.2 | 1.44 | 0.1 | 0.1 |
| 10.916666666666789 | 0.2 | 1.44 | 0.1 | 0.1 |
| 10.933333333333456 | 0.2 | 1.44 | 0.1 | 0.1 |
| 10.950000000000124 | 0.2 | 1.44 | 0.1 | 0.1 |
| 10.966666666666791 | 0.2 | 1.44 | 0.1 | 0.1 |
| 10.983333333333459 | 0.2 | 1.44 | 0.1 | 0.1 |
| 11.000000000000126 | 0.24 | 1.44 | 0.12 | 0.12 |
| 11.016666666666794 | 0.46 | 1.44 | 0.23 | 0.23 |
| 11.033333333333461 | 0.82 | 1.44 | 0.41 | 0.41 |
| 11.050000000000129 | 1.11 | 1.44 | 0.55 | 0.55 |
| 11.066666666666796 | 1.27 | 1.44 | 0.63 | 0.63 |
| 11.083333333333464 | 1.35 | 1.44 | 0.67 | 0.67 |
| 11.100000000000131 | 1.4 | 1.44 | 0.7 | 0.7 |
| 11.116666666666799 | 1.43 | 1.44 | 0.72 | 0.72 |
| 11.133333333333466 | 1.43 | 1.44 | 0.72 | 0.72 |
| 11.150000000000134 | 1.43 | 1.44 | 0.72 | 0.72 |
| 11.166666666666801 | 1.43 | 1.44 | 0.72 | 0.72 |
| 11.183333333333469 | 1.43 | 1.44 | 0.72 | 0.72 |
| 11.200000000000136 | 1.43 | 1.44 | 0.72 | 0.72 |
| 11.216666666666804 | 1.43 | 1.44 | 0.72 | 0.72 |
| 11.233333333333471 | 1.43 | 1.44 | 0.72 | 0.72 |
| 11.250000000000139 | 1.43 | 1.44 | 0.72 | 0.72 |
| 11.266666666666806 | 1.43 | 1.44 | 0.72 | 0.72 |
| 11.283333333333474 | 1.43 | 1.44 | 0.72 | 0.72 |
| 11.300000000000141 | 1.43 | 1.44 | 0.72 | 0.72 |
| 11.316666666666809 | 1.43 | 1.44 | 0.72 | 0.72 |
| 11.333333333333476 | 1.43 | 1.44 | 0.72 | 0.72 |
| 11.350000000000144 | 1.43 | 1.44 | 0.72 | 0.72 |
| 11.366666666666811 | 1.43 | 1.44 | 0.72 | 0.72 |
| 11.383333333333479 | 1.43 | 1.44 | 0.72 | 0.72 |
| 11.400000000000146 | 1.43 | 1.44 | 0.72 | 0.72 |
| 11.416666666666814 | 1.43 | 1.44 | 0.72 | 0.72 |
| 11.433333333333481 | 1.43 | 1.44 | 0.72 | 0.72 |
| 11.450000000000149 | 1.43 | 1.44 | 0.72 | 0.72 |
| 11.466666666666816 | 1.43 | 1.44 | 0.72 | 0.72 |
| 11.483333333333483 | 1.43 | 1.44 | 0.72 | 0.72 |
| 11.500000000000151 | 1.43 | 1.44 | 0.72 | 0.72 |
| 11.516666666666818 | 1.43 | 1.44 | 0.72 | 0.72 |
| 11.533333333333486 | 1.43 | 1.44 | 0.72 | 0.72 |
| 11.550000000000153 | 1.43 | 1.44 | 0.72 | 0.72 |
| 11.566666666666821 | 1.43 | 1.44 | 0.72 | 0.72 |
| 11.583333333333488 | 1.43 | 1.44 | 0.72 | 0.72 |
| 11.600000000000156 | 1.43 | 1.44 | 0.72 | 0.72 |
| 11.616666666666823 | 1.43 | 1.44 | 0.72 | 0.72 |
| 11.633333333333491 | 1.43 | 1.44 | 0.72 | 0.72 |
| 11.650000000000158 | 1.43 | 1.44 | 0.72 | 0.72 |
| 11.666666666666826 | 1.43 | 1.44 | 0.72 | 0.72 |
| 11.683333333333493 | 1.43 | 1.44 | 0.72 | 0.72 |
| 11.700000000000161 | 1.43 | 1.44 | 0.72 | 0.72 |
| 11.716666666666828 | 1.43 | 1.44 | 0.72 | 0.72 |
| 11.733333333333496 | 1.43 | 1.44 | 0.72 | 0.72 |
| 11.750000000000163 | 1.43 | 1.44 | 0.72 | 0.72 |
| 11.766666666666831 | 1.43 | 1.44 | 0.72 | 0.72 |
| 11.783333333333498 | 1.43 | 1.44 | 0.72 | 0.72 |
| 11.800000000000166 | 1.43 | 1.44 | 0.72 | 0.72 |
| 11.816666666666833 | 1.43 | 1.44 | 0.72 | 0.72 |
| 11.833333333333501 | 1.43 | 1.44 | 0.72 | 0.72 |
| 11.850000000000168 | 1.43 | 1.44 | 0.72 | 0.72 |
| 11.866666666666836 | 1.43 | 1.44 | 0.72 | 0.72 |
| 11.883333333333503 | 1.43 | 1.44 | 0.72 | 0.72 |
| 11.90000000000017 | 1.43 | 1.44 | 0.72 | 0.72 |
| 11.916666666666838 | 1.43 | 1.44 | 0.72 | 0.72 |
| 11.933333333333506 | 1.43 | 1.44 | 0.72 | 0.72 |
| 11.950000000000173 | 1.43 | 1.44 | 0.72 | 0.72 |
| 11.96666666666684 | 1.43 | 1.44 | 0.72 | 0.72 |
| 11.983333333333508 | 1.43 | 1.44 | 0.72 | 0.72 |
| 12.000000000000176 | 1.36 | 1.44 | 0.68 | 0.68 |
| 12.016666666666843 | 1.07 | 1.44 | 0.54 | 0.54 |
| 12.03333333333351 | 0.89 | 1.44 | 0.45 | 0.45 |
| 12.050000000000178 | 0.77 | 1.44 | 0.39 | 0.39 |
| 12.066666666666846 | 0.69 | 1.44 | 0.35 | 0.35 |
| 12.083333333333513 | 0.64 | 1.44 | 0.32 | 0.32 |
| 12.10000000000018 | 0.6 | 1.44 | 0.3 | 0.3 |
| 12.116666666666848 | 0.58 | 1.44 | 0.29 | 0.29 |
| 12.133333333333516 | 0.57 | 1.44 | 0.28 | 0.28 |
| 12.150000000000183 | 0.56 | 1.44 | 0.28 | 0.28 |
| 12.16666666666685 | 0.55 | 1.44 | 0.28 | 0.28 |
| 12.183333333333518 | 0.55 | 1.44 | 0.28 | 0.28 |
| 12.200000000000186 | 0.55 | 1.44 | 0.28 | 0.28 |
| 12.216666666666853 | 0.55 | 1.44 | 0.28 | 0.28 |
| 12.23333333333352 | 0.55 | 1.44 | 0.28 | 0.28 |
| 12.250000000000188 | 0.55 | 1.44 | 0.28 | 0.28 |
| 12.266666666666856 | 0.55 | 1.44 | 0.28 | 0.28 |
| 12.283333333333523 | 0.55 | 1.44 | 0.28 | 0.28 |
| 12.30000000000019 | 0.55 | 1.44 | 0.28 | 0.28 |
| 12.316666666666858 | 0.55 | 1.44 | 0.28 | 0.28 |
| 12.333333333333526 | 0.55 | 1.44 | 0.28 | 0.28 |
| 12.350000000000193 | 0.55 | 1.44 | 0.28 | 0.28 |
| 12.36666666666686 | 0.55 | 1.44 | 0.28 | 0.28 |
| 12.383333333333528 | 0.55 | 1.44 | 0.28 | 0.28 |
| 12.400000000000196 | 0.55 | 1.44 | 0.28 | 0.28 |
| 12.416666666666863 | 0.55 | 1.44 | 0.28 | 0.28 |
| 12.43333333333353 | 0.55 | 1.44 | 0.28 | 0.28 |
| 12.450000000000198 | 0.55 | 1.44 | 0.28 | 0.28 |
| 12.466666666666866 | 0.55 | 1.44 | 0.28 | 0.28 |
| 12.483333333333533 | 0.55 | 1.44 | 0.28 | 0.28 |
| 12.5000000000002 | 0.55 | 1.44 | 0.28 | 0.28 |
| 12.516666666666868 | 0.55 | 1.44 | 0.28 | 0.28 |
| 12.533333333333536 | 0.55 | 1.44 | 0.28 | 0.28 |
| 12.550000000000203 | 0.55 | 1.44 | 0.28 | 0.28 |
| 12.56666666666687 | 0.55 | 1.44 | 0.28 | 0.28 |
| 12.583333333333538 | 0.55 | 1.44 | 0.28 | 0.28 |
| 12.600000000000206 | 0.55 | 1.44 | 0.28 | 0.28 |
| 12.616666666666873 | 0.55 | 1.44 | 0.28 | 0.28 |
| 12.63333333333354 | 0.55 | 1.44 | 0.28 | 0.28 |
| 12.650000000000208 | 0.55 | 1.44 | 0.28 | 0.28 |
| 12.666666666666876 | 0.55 | 1.44 | 0.28 | 0.28 |
| 12.683333333333543 | 0.55 | 1.44 | 0.28 | 0.28 |
| 12.70000000000021 | 0.55 | 1.44 | 0.28 | 0.28 |
| 12.716666666666878 | 0.55 | 1.44 | 0.28 | 0.28 |
| 12.733333333333546 | 0.55 | 1.44 | 0.28 | 0.28 |
| 12.750000000000213 | 0.55 | 1.44 | 0.28 | 0.28 |
| 12.76666666666688 | 0.55 | 1.44 | 0.28 | 0.28 |
| 12.783333333333548 | 0.55 | 1.44 | 0.28 | 0.28 |
| 12.800000000000216 | 0.55 | 1.44 | 0.28 | 0.28 |
| 12.816666666666883 | 0.55 | 1.44 | 0.28 | 0.28 |
| 12.83333333333355 | 0.55 | 1.44 | 0.28 | 0.28 |
| 12.850000000000218 | 0.55 | 1.44 | 0.28 | 0.28 |
| 12.866666666666886 | 0.55 | 1.44 | 0.28 | 0.28 |
| 12.883333333333553 | 0.55 | 1.44 | 0.28 | 0.28 |
| 12.90000000000022 | 0.55 | 1.44 | 0.28 | 0.28 |
| 12.916666666666888 | 0.55 | 1.44 | 0.28 | 0.28 |
| 12.933333333333556 | 0.55 | 1.44 | 0.28 | 0.28 |
| 12.950000000000223 | 0.55 | 1.44 | 0.28 | 0.28 |
| 12.96666666666689 | 0.55 | 1.44 | 0.28 | 0.28 |
| 12.983333333333558 | 0.55 | 1.44 | 0.28 | 0.28 |
| 13.000000000000226 | 0.54 | 1.44 | 0.27 | 0.27 |
| 13.016666666666893 | 0.53 | 1.44 | 0.26 | 0.26 |
| 13.03333333333356 | 0.52 | 1.44 | 0.26 | 0.26 |
| 13.050000000000228 | 0.5 | 1.44 | 0.25 | 0.25 |
| 13.066666666666896 | 0.5 | 1.44 | 0.25 | 0.25 |
| 13.083333333333563 | 0.5 | 1.44 | 0.25 | 0.25 |
| 13.10000000000023 | 0.5 | 1.44 | 0.25 | 0.25 |
| 13.116666666666898 | 0.49 | 1.44 | 0.25 | 0.25 |
| 13.133333333333566 | 0.49 | 1.44 | 0.25 | 0.25 |
| 13.150000000000233 | 0.49 | 1.44 | 0.25 | 0.25 |
| 13.1666666666669 | 0.49 | 1.44 | 0.25 | 0.25 |
| 13.183333333333568 | 0.49 | 1.44 | 0.25 | 0.25 |
| 13.200000000000236 | 0.49 | 1.44 | 0.25 | 0.25 |
| 13.216666666666903 | 0.49 | 1.44 | 0.25 | 0.25 |
| 13.23333333333357 | 0.49 | 1.44 | 0.25 | 0.25 |
| 13.250000000000238 | 0.49 | 1.44 | 0.25 | 0.25 |
| 13.266666666666906 | 0.49 | 1.44 | 0.25 | 0.25 |
| 13.283333333333573 | 0.49 | 1.44 | 0.25 | 0.25 |
| 13.30000000000024 | 0.49 | 1.44 | 0.25 | 0.25 |
| 13.316666666666908 | 0.49 | 1.44 | 0.25 | 0.25 |
| 13.333333333333576 | 0.49 | 1.44 | 0.25 | 0.25 |
| 13.350000000000243 | 0.49 | 1.44 | 0.25 | 0.25 |
| 13.36666666666691 | 0.49 | 1.44 | 0.25 | 0.25 |
| 13.383333333333578 | 0.49 | 1.44 | 0.25 | 0.25 |
| 13.400000000000245 | 0.49 | 1.44 | 0.25 | 0.25 |
| 13.416666666666913 | 0.49 | 1.44 | 0.25 | 0.25 |
| 13.43333333333358 | 0.49 | 1.44 | 0.25 | 0.25 |
| 13.450000000000248 | 0.49 | 1.44 | 0.25 | 0.25 |
| 13.466666666666915 | 0.49 | 1.44 | 0.25 | 0.25 |
| 13.483333333333583 | 0.49 | 1.44 | 0.25 | 0.25 |
| 13.50000000000025 | 0.49 | 1.44 | 0.25 | 0.25 |
| 13.516666666666918 | 0.49 | 1.44 | 0.25 | 0.25 |
| 13.533333333333585 | 0.49 | 1.44 | 0.25 | 0.25 |
| 13.550000000000253 | 0.49 | 1.44 | 0.25 | 0.25 |
| 13.56666666666692 | 0.49 | 1.44 | 0.25 | 0.25 |
| 13.583333333333588 | 0.49 | 1.44 | 0.25 | 0.25 |
| 13.600000000000255 | 0.49 | 1.44 | 0.25 | 0.25 |
| 13.616666666666923 | 0.49 | 1.44 | 0.25 | 0.25 |
| 13.63333333333359 | 0.49 | 1.44 | 0.25 | 0.25 |
| 13.650000000000258 | 0.49 | 1.44 | 0.25 | 0.25 |
| 13.666666666666925 | 0.49 | 1.44 | 0.25 | 0.25 |
| 13.683333333333593 | 0.49 | 1.44 | 0.25 | 0.25 |
| 13.70000000000026 | 0.49 | 1.44 | 0.25 | 0.25 |
| 13.716666666666928 | 0.49 | 1.44 | 0.25 | 0.25 |
| 13.733333333333595 | 0.49 | 1.44 | 0.25 | 0.25 |
| 13.750000000000263 | 0.49 | 1.44 | 0.25 | 0.25 |
| 13.76666666666693 | 0.49 | 1.44 | 0.25 | 0.25 |
| 13.783333333333598 | 0.49 | 1.44 | 0.25 | 0.25 |
| 13.800000000000265 | 0.49 | 1.44 | 0.25 | 0.25 |
| 13.816666666666933 | 0.49 | 1.44 | 0.25 | 0.25 |
| 13.8333333333336 | 0.49 | 1.44 | 0.25 | 0.25 |
| 13.850000000000268 | 0.49 | 1.44 | 0.25 | 0.25 |
| 13.866666666666935 | 0.49 | 1.44 | 0.25 | 0.25 |
| 13.883333333333603 | 0.49 | 1.44 | 0.25 | 0.25 |
| 13.90000000000027 | 0.49 | 1.44 | 0.25 | 0.25 |
| 13.916666666666938 | 0.49 | 1.44 | 0.25 | 0.25 |
| 13.933333333333605 | 0.49 | 1.44 | 0.25 | 0.25 |
| 13.950000000000273 | 0.49 | 1.44 | 0.25 | 0.25 |
| 13.96666666666694 | 0.49 | 1.44 | 0.25 | 0.25 |
| 13.983333333333608 | 0.49 | 1.44 | 0.25 | 0.25 |
| 14.000000000000275 | 0.5 | 1.44 | 0.25 | 0.25 |
| 14.016666666666943 | 0.59 | 1.44 | 0.29 | 0.29 |
| 14.03333333333361 | 0.68 | 1.44 | 0.34 | 0.34 |
| 14.050000000000278 | 0.75 | 1.44 | 0.38 | 0.38 |
| 14.066666666666945 | 0.8 | 1.44 | 0.4 | 0.4 |
| 14.083333333333613 | 0.83 | 1.44 | 0.41 | 0.41 |
| 14.10000000000028 | 0.85 | 1.44 | 0.42 | 0.42 |
| 14.116666666666948 | 0.85 | 1.44 | 0.43 | 0.43 |
| 14.133333333333615 | 0.85 | 1.44 | 0.43 | 0.43 |
| 14.150000000000283 | 0.85 | 1.44 | 0.43 | 0.43 |
| 14.16666666666695 | 0.85 | 1.44 | 0.43 | 0.43 |
| 14.183333333333618 | 0.85 | 1.44 | 0.43 | 0.43 |
| 14.200000000000285 | 0.85 | 1.44 | 0.43 | 0.43 |
| 14.216666666666953 | 0.85 | 1.44 | 0.43 | 0.43 |
| 14.23333333333362 | 0.85 | 1.44 | 0.43 | 0.43 |
| 14.250000000000288 | 0.85 | 1.44 | 0.43 | 0.43 |
| 14.266666666666955 | 0.85 | 1.44 | 0.43 | 0.43 |
| 14.283333333333623 | 0.85 | 1.44 | 0.43 | 0.43 |
| 14.30000000000029 | 0.85 | 1.44 | 0.43 | 0.43 |
| 14.316666666666958 | 0.85 | 1.44 | 0.43 | 0.43 |
| 14.333333333333625 | 0.85 | 1.44 | 0.43 | 0.43 |
| 14.350000000000293 | 0.85 | 1.44 | 0.43 | 0.43 |
| 14.36666666666696 | 0.85 | 1.44 | 0.43 | 0.43 |
| 14.383333333333628 | 0.85 | 1.44 | 0.43 | 0.43 |
| 14.400000000000295 | 0.85 | 1.44 | 0.43 | 0.43 |
| 14.416666666666963 | 0.85 | 1.44 | 0.43 | 0.43 |
| 14.43333333333363 | 0.85 | 1.44 | 0.43 | 0.43 |
| 14.450000000000298 | 0.85 | 1.44 | 0.43 | 0.43 |
| 14.466666666666965 | 0.85 | 1.44 | 0.43 | 0.43 |
| 14.483333333333633 | 0.85 | 1.44 | 0.43 | 0.43 |
| 14.5000000000003 | 0.85 | 1.44 | 0.43 | 0.43 |
| 14.516666666666968 | 0.85 | 1.44 | 0.43 | 0.43 |
| 14.533333333333635 | 0.85 | 1.44 | 0.43 | 0.43 |
| 14.550000000000303 | 0.85 | 1.44 | 0.43 | 0.43 |
| 14.56666666666697 | 0.85 | 1.44 | 0.43 | 0.43 |
| 14.583333333333638 | 0.85 | 1.44 | 0.43 | 0.43 |
| 14.600000000000305 | 0.85 | 1.44 | 0.43 | 0.43 |
| 14.616666666666973 | 0.85 | 1.44 | 0.43 | 0.43 |
| 14.63333333333364 | 0.85 | 1.44 | 0.43 | 0.43 |
| 14.650000000000308 | 0.85 | 1.44 | 0.43 | 0.43 |
| 14.666666666666975 | 0.85 | 1.44 | 0.43 | 0.43 |
| 14.683333333333643 | 0.85 | 1.44 | 0.43 | 0.43 |
| 14.70000000000031 | 0.85 | 1.44 | 0.43 | 0.43 |
| 14.716666666666978 | 0.85 | 1.44 | 0.43 | 0.43 |
| 14.733333333333645 | 0.85 | 1.44 | 0.43 | 0.43 |
| 14.750000000000313 | 0.85 | 1.44 | 0.43 | 0.43 |
| 14.76666666666698 | 0.85 | 1.44 | 0.43 | 0.43 |
| 14.783333333333648 | 0.85 | 1.44 | 0.43 | 0.43 |
| 14.800000000000315 | 0.85 | 1.44 | 0.43 | 0.43 |
| 14.816666666666983 | 0.85 | 1.44 | 0.43 | 0.43 |
| 14.83333333333365 | 0.85 | 1.44 | 0.43 | 0.43 |
| 14.850000000000318 | 0.85 | 1.44 | 0.43 | 0.43 |
| 14.866666666666985 | 0.85 | 1.44 | 0.43 | 0.43 |
| 14.883333333333653 | 0.85 | 1.44 | 0.43 | 0.43 |
| 14.90000000000032 | 0.85 | 1.44 | 0.43 | 0.43 |
| 14.916666666666988 | 0.85 | 1.44 | 0.43 | 0.43 |
| 14.933333333333655 | 0.85 | 1.44 | 0.43 | 0.43 |
| 14.950000000000323 | 0.85 | 1.44 | 0.43 | 0.43 |
| 14.96666666666699 | 0.85 | 1.44 | 0.43 | 0.43 |
| 14.983333333333658 | 0.85 | 1.44 | 0.43 | 0.43 |
| 15.000000000000325 | 0.85 | 1.44 | 0.43 | 0.43 |
| 15.016666666666993 | 0.85 | 1.44 | 0.42 | 0.42 |
| 15.03333333333366 | 0.8 | 1.44 | 0.4 | 0.4 |
| 15.050000000000328 | 0.78 | 1.44 | 0.39 | 0.39 |
| 15.066666666666995 | 0.76 | 1.44 | 0.38 | 0.38 |
| 15.083333333333663 | 0.76 | 1.44 | 0.38 | 0.38 |
| 15.10000000000033 | 0.76 | 1.44 | 0.38 | 0.38 |
| 15.116666666666998 | 0.76 | 1.44 | 0.38 | 0.38 |
| 15.133333333333665 | 0.76 | 1.44 | 0.38 | 0.38 |
| 15.150000000000333 | 0.76 | 1.44 | 0.38 | 0.38 |
| 15.166666666667 | 0.76 | 1.44 | 0.38 | 0.38 |
| 15.183333333333668 | 0.76 | 1.44 | 0.38 | 0.38 |
| 15.200000000000335 | 0.76 | 1.44 | 0.38 | 0.38 |
| 15.216666666667003 | 0.76 | 1.44 | 0.38 | 0.38 |
| 15.23333333333367 | 0.76 | 1.44 | 0.38 | 0.38 |
| 15.250000000000338 | 0.76 | 1.44 | 0.38 | 0.38 |
| 15.266666666667005 | 0.76 | 1.44 | 0.38 | 0.38 |
| 15.283333333333672 | 0.76 | 1.44 | 0.38 | 0.38 |
| 15.30000000000034 | 0.76 | 1.44 | 0.38 | 0.38 |
| 15.316666666667007 | 0.76 | 1.44 | 0.38 | 0.38 |
| 15.333333333333675 | 0.76 | 1.44 | 0.38 | 0.38 |
| 15.350000000000342 | 0.76 | 1.44 | 0.38 | 0.38 |
| 15.36666666666701 | 0.76 | 1.44 | 0.38 | 0.38 |
| 15.383333333333677 | 0.76 | 1.44 | 0.38 | 0.38 |
| 15.400000000000345 | 0.76 | 1.44 | 0.38 | 0.38 |
| 15.416666666667012 | 0.76 | 1.44 | 0.38 | 0.38 |
| 15.43333333333368 | 0.76 | 1.44 | 0.38 | 0.38 |
| 15.450000000000347 | 0.76 | 1.44 | 0.38 | 0.38 |
| 15.466666666667015 | 0.76 | 1.44 | 0.38 | 0.38 |
| 15.483333333333682 | 0.76 | 1.44 | 0.38 | 0.38 |
| 15.50000000000035 | 0.76 | 1.44 | 0.38 | 0.38 |
| 15.516666666667017 | 0.76 | 1.44 | 0.38 | 0.38 |
| 15.533333333333685 | 0.76 | 1.44 | 0.38 | 0.38 |
| 15.550000000000352 | 0.76 | 1.44 | 0.38 | 0.38 |
| 15.56666666666702 | 0.76 | 1.44 | 0.38 | 0.38 |
| 15.583333333333687 | 0.76 | 1.44 | 0.38 | 0.38 |
| 15.600000000000355 | 0.76 | 1.44 | 0.38 | 0.38 |
| 15.616666666667022 | 0.76 | 1.44 | 0.38 | 0.38 |
| 15.63333333333369 | 0.76 | 1.44 | 0.38 | 0.38 |
| 15.650000000000357 | 0.76 | 1.44 | 0.38 | 0.38 |
| 15.666666666667025 | 0.76 | 1.44 | 0.38 | 0.38 |
| 15.683333333333692 | 0.76 | 1.44 | 0.38 | 0.38 |
| 15.70000000000036 | 0.76 | 1.44 | 0.38 | 0.38 |
| 15.716666666667027 | 0.76 | 1.44 | 0.38 | 0.38 |
| 15.733333333333695 | 0.76 | 1.44 | 0.38 | 0.38 |
| 15.750000000000362 | 0.76 | 1.44 | 0.38 | 0.38 |
| 15.76666666666703 | 0.76 | 1.44 | 0.38 | 0.38 |
| 15.783333333333697 | 0.76 | 1.44 | 0.38 | 0.38 |
| 15.800000000000365 | 0.76 | 1.44 | 0.38 | 0.38 |
| 15.816666666667032 | 0.76 | 1.44 | 0.38 | 0.38 |
| 15.8333333333337 | 0.76 | 1.44 | 0.38 | 0.38 |
| 15.850000000000367 | 0.76 | 1.44 | 0.38 | 0.38 |
| 15.866666666667035 | 0.76 | 1.44 | 0.38 | 0.38 |
| 15.883333333333702 | 0.76 | 1.44 | 0.38 | 0.38 |
| 15.90000000000037 | 0.76 | 1.44 | 0.38 | 0.38 |
| 15.916666666667037 | 0.76 | 1.44 | 0.38 | 0.38 |
| 15.933333333333705 | 0.76 | 1.44 | 0.38 | 0.38 |
| 15.950000000000372 | 0.76 | 1.44 | 0.38 | 0.38 |
| 15.96666666666704 | 0.76 | 1.44 | 0.38 | 0.38 |
| 15.983333333333707 | 0.76 | 1.44 | 0.38 | 0.38 |
| 16.000000000000373 | 0.74 | 1.44 | 0.37 | 0.37 |
| 16.01666666666704 | 0.72 | 1.44 | 0.36 | 0.36 |
| 16.033333333333704 | 0.71 | 1.44 | 0.35 | 0.35 |
| 16.05000000000037 | 0.7 | 1.44 | 0.35 | 0.35 |
| 16.066666666667036 | 0.7 | 1.44 | 0.35 | 0.35 |
| 16.0833333333337 | 0.7 | 1.44 | 0.35 | 0.35 |
| 16.100000000000367 | 0.7 | 1.44 | 0.35 | 0.35 |
| 16.116666666667033 | 0.7 | 1.44 | 0.35 | 0.35 |
| 16.1333333333337 | 0.7 | 1.44 | 0.35 | 0.35 |
| 16.150000000000365 | 0.7 | 1.44 | 0.35 | 0.35 |
| 16.16666666666703 | 0.7 | 1.44 | 0.35 | 0.35 |
| 16.183333333333696 | 0.7 | 1.44 | 0.35 | 0.35 |
| 16.20000000000036 | 0.7 | 1.44 | 0.35 | 0.35 |
| 16.216666666667027 | 0.7 | 1.44 | 0.35 | 0.35 |
| 16.233333333333693 | 0.7 | 1.44 | 0.35 | 0.35 |
| 16.25000000000036 | 0.7 | 1.44 | 0.35 | 0.35 |
| 16.266666666667025 | 0.7 | 1.44 | 0.35 | 0.35 |
| 16.28333333333369 | 0.7 | 1.44 | 0.35 | 0.35 |
| 16.300000000000356 | 0.7 | 1.44 | 0.35 | 0.35 |
| 16.31666666666702 | 0.7 | 1.44 | 0.35 | 0.35 |
| 16.333333333333687 | 0.7 | 1.44 | 0.35 | 0.35 |
| 16.350000000000353 | 0.7 | 1.44 | 0.35 | 0.35 |
| 16.36666666666702 | 0.7 | 1.44 | 0.35 | 0.35 |
| 16.383333333333685 | 0.7 | 1.44 | 0.35 | 0.35 |
| 16.40000000000035 | 0.7 | 1.44 | 0.35 | 0.35 |
| 16.416666666667016 | 0.7 | 1.44 | 0.35 | 0.35 |
| 16.43333333333368 | 0.7 | 1.44 | 0.35 | 0.35 |
| 16.450000000000347 | 0.7 | 1.44 | 0.35 | 0.35 |
| 16.466666666667013 | 0.7 | 1.44 | 0.35 | 0.35 |
| 16.48333333333368 | 0.7 | 1.44 | 0.35 | 0.35 |
| 16.500000000000345 | 0.7 | 1.44 | 0.35 | 0.35 |
| 16.51666666666701 | 0.7 | 1.44 | 0.35 | 0.35 |
| 16.533333333333676 | 0.7 | 1.44 | 0.35 | 0.35 |
| 16.55000000000034 | 0.7 | 1.44 | 0.35 | 0.35 |
| 16.566666666667007 | 0.7 | 1.44 | 0.35 | 0.35 |
| 16.583333333333673 | 0.7 | 1.44 | 0.35 | 0.35 |
| 16.60000000000034 | 0.7 | 1.44 | 0.35 | 0.35 |
| 16.616666666667005 | 0.7 | 1.44 | 0.35 | 0.35 |
| 16.63333333333367 | 0.7 | 1.44 | 0.35 | 0.35 |
| 16.650000000000336 | 0.7 | 1.44 | 0.35 | 0.35 |
| 16.666666666667002 | 0.7 | 1.44 | 0.35 | 0.35 |
| 16.683333333333668 | 0.7 | 1.44 | 0.35 | 0.35 |
| 16.700000000000333 | 0.7 | 1.44 | 0.35 | 0.35 |
| 16.716666666667 | 0.7 | 1.44 | 0.35 | 0.35 |
| 16.733333333333665 | 0.7 | 1.44 | 0.35 | 0.35 |
| 16.75000000000033 | 0.7 | 1.44 | 0.35 | 0.35 |
| 16.766666666666996 | 0.7 | 1.44 | 0.35 | 0.35 |
| 16.783333333333662 | 0.7 | 1.44 | 0.35 | 0.35 |
| 16.800000000000328 | 0.7 | 1.44 | 0.35 | 0.35 |
| 16.816666666666993 | 0.7 | 1.44 | 0.35 | 0.35 |
| 16.83333333333366 | 0.7 | 1.44 | 0.35 | 0.35 |
| 16.850000000000325 | 0.7 | 1.44 | 0.35 | 0.35 |
| 16.86666666666699 | 0.7 | 1.44 | 0.35 | 0.35 |
| 16.883333333333656 | 0.7 | 1.44 | 0.35 | 0.35 |
| 16.900000000000322 | 0.7 | 1.44 | 0.35 | 0.35 |
| 16.916666666666988 | 0.7 | 1.44 | 0.35 | 0.35 |
| 16.933333333333653 | 0.7 | 1.44 | 0.35 | 0.35 |
| 16.95000000000032 | 0.7 | 1.44 | 0.35 | 0.35 |
| 16.966666666666985 | 0.7 | 1.44 | 0.35 | 0.35 |
| 16.98333333333365 | 0.7 | 1.44 | 0.35 | 0.35 |
| 17.000000000000316 | 0.67 | 1.44 | 0.34 | 0.34 |
| 17.016666666666982 | 0.61 | 1.44 | 0.31 | 0.31 |
| 17.033333333333648 | 0.56 | 1.44 | 0.28 | 0.28 |
| 17.050000000000313 | 0.52 | 1.44 | 0.26 | 0.26 |
| 17.06666666666698 | 0.49 | 1.44 | 0.25 | 0.25 |
| 17.083333333333645 | 0.47 | 1.44 | 0.24 | 0.24 |
| 17.10000000000031 | 0.46 | 1.44 | 0.23 | 0.23 |
| 17.116666666666976 | 0.45 | 1.44 | 0.22 | 0.22 |
| 17.133333333333642 | 0.44 | 1.44 | 0.22 | 0.22 |
| 17.150000000000308 | 0.44 | 1.44 | 0.22 | 0.22 |
| 17.166666666666973 | 0.44 | 1.44 | 0.22 | 0.22 |
| 17.18333333333364 | 0.44 | 1.44 | 0.22 | 0.22 |
| 17.200000000000305 | 0.44 | 1.44 | 0.22 | 0.22 |
| 17.21666666666697 | 0.44 | 1.44 | 0.22 | 0.22 |
| 17.233333333333636 | 0.44 | 1.44 | 0.22 | 0.22 |
| 17.250000000000302 | 0.44 | 1.44 | 0.22 | 0.22 |
| 17.266666666666968 | 0.44 | 1.44 | 0.22 | 0.22 |
| 17.283333333333633 | 0.44 | 1.44 | 0.22 | 0.22 |
| 17.3000000000003 | 0.44 | 1.44 | 0.22 | 0.22 |
| 17.316666666666965 | 0.44 | 1.44 | 0.22 | 0.22 |
| 17.33333333333363 | 0.44 | 1.44 | 0.22 | 0.22 |
| 17.350000000000296 | 0.44 | 1.44 | 0.22 | 0.22 |
| 17.366666666666962 | 0.44 | 1.44 | 0.22 | 0.22 |
| 17.383333333333628 | 0.44 | 1.44 | 0.22 | 0.22 |
| 17.400000000000293 | 0.44 | 1.44 | 0.22 | 0.22 |
| 17.41666666666696 | 0.44 | 1.44 | 0.22 | 0.22 |
| 17.433333333333625 | 0.44 | 1.44 | 0.22 | 0.22 |
| 17.45000000000029 | 0.44 | 1.44 | 0.22 | 0.22 |
| 17.466666666666956 | 0.44 | 1.44 | 0.22 | 0.22 |
| 17.483333333333622 | 0.44 | 1.44 | 0.22 | 0.22 |
| 17.500000000000288 | 0.44 | 1.44 | 0.22 | 0.22 |
| 17.516666666666953 | 0.44 | 1.44 | 0.22 | 0.22 |
| 17.53333333333362 | 0.44 | 1.44 | 0.22 | 0.22 |
| 17.550000000000285 | 0.44 | 1.44 | 0.22 | 0.22 |
| 17.56666666666695 | 0.44 | 1.44 | 0.22 | 0.22 |
| 17.583333333333616 | 0.44 | 1.44 | 0.22 | 0.22 |
| 17.600000000000282 | 0.44 | 1.44 | 0.22 | 0.22 |
| 17.616666666666948 | 0.44 | 1.44 | 0.22 | 0.22 |
| 17.633333333333614 | 0.44 | 1.44 | 0.22 | 0.22 |
| 17.65000000000028 | 0.44 | 1.44 | 0.22 | 0.22 |
| 17.666666666666945 | 0.44 | 1.44 | 0.22 | 0.22 |
| 17.68333333333361 | 0.44 | 1.44 | 0.22 | 0.22 |
| 17.700000000000276 | 0.44 | 1.44 | 0.22 | 0.22 |
| 17.716666666666942 | 0.44 | 1.44 | 0.22 | 0.22 |
| 17.733333333333608 | 0.44 | 1.44 | 0.22 | 0.22 |
| 17.750000000000274 | 0.44 | 1.44 | 0.22 | 0.22 |
| 17.76666666666694 | 0.44 | 1.44 | 0.22 | 0.22 |
| 17.783333333333605 | 0.44 | 1.44 | 0.22 | 0.22 |
| 17.80000000000027 | 0.44 | 1.44 | 0.22 | 0.22 |
| 17.816666666666936 | 0.44 | 1.44 | 0.22 | 0.22 |
| 17.833333333333602 | 0.44 | 1.44 | 0.22 | 0.22 |
| 17.850000000000268 | 0.44 | 1.44 | 0.22 | 0.22 |
| 17.866666666666934 | 0.44 | 1.44 | 0.22 | 0.22 |
| 17.8833333333336 | 0.44 | 1.44 | 0.22 | 0.22 |
| 17.900000000000265 | 0.44 | 1.44 | 0.22 | 0.22 |
| 17.91666666666693 | 0.44 | 1.44 | 0.22 | 0.22 |
| 17.933333333333596 | 0.44 | 1.44 | 0.22 | 0.22 |
| 17.950000000000262 | 0.44 | 1.44 | 0.22 | 0.22 |
| 17.966666666666928 | 0.44 | 1.44 | 0.22 | 0.22 |
| 17.983333333333594 | 0.44 | 1.44 | 0.22 | 0.22 |
| 18.00000000000026 | 0.44 | 1.44 | 0.22 | 0.22 |
| 18.016666666666925 | 0.44 | 1.44 | 0.22 | 0.22 |
| 18.03333333333359 | 0.44 | 1.44 | 0.22 | 0.22 |
| 18.050000000000257 | 0.44 | 1.44 | 0.22 | 0.22 |
| 18.066666666666922 | 0.44 | 1.44 | 0.22 | 0.22 |
| 18.083333333333588 | 0.44 | 1.44 | 0.22 | 0.22 |
| 18.100000000000254 | 0.44 | 1.44 | 0.22 | 0.22 |
| 18.11666666666692 | 0.44 | 1.44 | 0.22 | 0.22 |
| 18.133333333333585 | 0.44 | 1.44 | 0.22 | 0.22 |
| 18.15000000000025 | 0.44 | 1.44 | 0.22 | 0.22 |
| 18.166666666666917 | 0.44 | 1.44 | 0.22 | 0.22 |
| 18.183333333333582 | 0.44 | 1.44 | 0.22 | 0.22 |
| 18.200000000000248 | 0.44 | 1.44 | 0.22 | 0.22 |
| 18.216666666666914 | 0.44 | 1.44 | 0.22 | 0.22 |
| 18.23333333333358 | 0.44 | 1.44 | 0.22 | 0.22 |
| 18.250000000000245 | 0.44 | 1.44 | 0.22 | 0.22 |
| 18.26666666666691 | 0.44 | 1.44 | 0.22 | 0.22 |
| 18.283333333333577 | 0.44 | 1.44 | 0.22 | 0.22 |
| 18.300000000000242 | 0.44 | 1.44 | 0.22 | 0.22 |
| 18.316666666666908 | 0.44 | 1.44 | 0.22 | 0.22 |
| 18.333333333333574 | 0.44 | 1.44 | 0.22 | 0.22 |
| 18.35000000000024 | 0.44 | 1.44 | 0.22 | 0.22 |
| 18.366666666666905 | 0.44 | 1.44 | 0.22 | 0.22 |
| 18.38333333333357 | 0.44 | 1.44 | 0.22 | 0.22 |
| 18.400000000000237 | 0.44 | 1.44 | 0.22 | 0.22 |
| 18.416666666666902 | 0.44 | 1.44 | 0.22 | 0.22 |
| 18.433333333333568 | 0.44 | 1.44 | 0.22 | 0.22 |
| 18.450000000000234 | 0.44 | 1.44 | 0.22 | 0.22 |
| 18.4666666666669 | 0.44 | 1.44 | 0.22 | 0.22 |
| 18.483333333333565 | 0.44 | 1.44 | 0.22 | 0.22 |
| 18.50000000000023 | 0.44 | 1.44 | 0.22 | 0.22 |
| 18.516666666666897 | 0.44 | 1.44 | 0.22 | 0.22 |
| 18.533333333333562 | 0.44 | 1.44 | 0.22 | 0.22 |
| 18.550000000000228 | 0.44 | 1.44 | 0.22 | 0.22 |
| 18.566666666666894 | 0.44 | 1.44 | 0.22 | 0.22 |
| 18.58333333333356 | 0.44 | 1.44 | 0.22 | 0.22 |
| 18.600000000000225 | 0.44 | 1.44 | 0.22 | 0.22 |
| 18.61666666666689 | 0.44 | 1.44 | 0.22 | 0.22 |
| 18.633333333333557 | 0.44 | 1.44 | 0.22 | 0.22 |
| 18.650000000000222 | 0.44 | 1.44 | 0.22 | 0.22 |
| 18.666666666666888 | 0.44 | 1.44 | 0.22 | 0.22 |
| 18.683333333333554 | 0.44 | 1.44 | 0.22 | 0.22 |
| 18.70000000000022 | 0.44 | 1.44 | 0.22 | 0.22 |
| 18.716666666666885 | 0.44 | 1.44 | 0.22 | 0.22 |
| 18.73333333333355 | 0.44 | 1.44 | 0.22 | 0.22 |
| 18.750000000000217 | 0.44 | 1.44 | 0.22 | 0.22 |
| 18.766666666666882 | 0.44 | 1.44 | 0.22 | 0.22 |
| 18.783333333333548 | 0.44 | 1.44 | 0.22 | 0.22 |
| 18.800000000000214 | 0.44 | 1.44 | 0.22 | 0.22 |
| 18.81666666666688 | 0.44 | 1.44 | 0.22 | 0.22 |
| 18.833333333333545 | 0.44 | 1.44 | 0.22 | 0.22 |
| 18.85000000000021 | 0.44 | 1.44 | 0.22 | 0.22 |
| 18.866666666666877 | 0.44 | 1.44 | 0.22 | 0.22 |
| 18.883333333333542 | 0.44 | 1.44 | 0.22 | 0.22 |
| 18.900000000000208 | 0.44 | 1.44 | 0.22 | 0.22 |
| 18.916666666666874 | 0.44 | 1.44 | 0.22 | 0.22 |
| 18.93333333333354 | 0.44 | 1.44 | 0.22 | 0.22 |
| 18.950000000000205 | 0.44 | 1.44 | 0.22 | 0.22 |
| 18.96666666666687 | 0.44 | 1.44 | 0.22 | 0.22 |
| 18.983333333333537 | 0.44 | 1.44 | 0.22 | 0.22 |
| 19.000000000000203 | 0.44 | 1.44 | 0.22 | 0.22 |
| 19.01666666666687 | 0.49 | 1.44 | 0.24 | 0.24 |
| 19.033333333333534 | 0.54 | 1.44 | 0.27 | 0.27 |
| 19.0500000000002 | 0.57 | 1.44 | 0.29 | 0.29 |
| 19.066666666666865 | 0.6 | 1.44 | 0.3 | 0.3 |
| 19.08333333333353 | 0.62 | 1.44 | 0.31 | 0.31 |
| 19.100000000000197 | 0.63 | 1.44 | 0.31 | 0.31 |
| 19.116666666666863 | 0.63 | 1.44 | 0.32 | 0.32 |
| 19.13333333333353 | 0.63 | 1.44 | 0.32 | 0.32 |
| 19.150000000000194 | 0.63 | 1.44 | 0.32 | 0.32 |
| 19.16666666666686 | 0.63 | 1.44 | 0.32 | 0.32 |
| 19.183333333333525 | 0.63 | 1.44 | 0.32 | 0.32 |
| 19.20000000000019 | 0.63 | 1.44 | 0.32 | 0.32 |
| 19.216666666666857 | 0.63 | 1.44 | 0.32 | 0.32 |
| 19.233333333333523 | 0.63 | 1.44 | 0.32 | 0.32 |
| 19.25000000000019 | 0.63 | 1.44 | 0.32 | 0.32 |
| 19.266666666666854 | 0.63 | 1.44 | 0.32 | 0.32 |
| 19.28333333333352 | 0.63 | 1.44 | 0.32 | 0.32 |
| 19.300000000000185 | 0.63 | 1.44 | 0.32 | 0.32 |
| 19.31666666666685 | 0.63 | 1.44 | 0.32 | 0.32 |
| 19.333333333333517 | 0.63 | 1.44 | 0.32 | 0.32 |
| 19.350000000000183 | 0.63 | 1.44 | 0.32 | 0.32 |
| 19.36666666666685 | 0.63 | 1.44 | 0.32 | 0.32 |
| 19.383333333333514 | 0.63 | 1.44 | 0.32 | 0.32 |
| 19.40000000000018 | 0.63 | 1.44 | 0.32 | 0.32 |
| 19.416666666666845 | 0.63 | 1.44 | 0.32 | 0.32 |
| 19.43333333333351 | 0.63 | 1.44 | 0.32 | 0.32 |
| 19.450000000000177 | 0.63 | 1.44 | 0.32 | 0.32 |
| 19.466666666666843 | 0.63 | 1.44 | 0.32 | 0.32 |
| 19.48333333333351 | 0.63 | 1.44 | 0.32 | 0.32 |
| 19.500000000000174 | 0.63 | 1.44 | 0.32 | 0.32 |
| 19.51666666666684 | 0.63 | 1.44 | 0.32 | 0.32 |
| 19.533333333333506 | 0.63 | 1.44 | 0.32 | 0.32 |
| 19.55000000000017 | 0.63 | 1.44 | 0.32 | 0.32 |
| 19.566666666666837 | 0.63 | 1.44 | 0.32 | 0.32 |
| 19.583333333333503 | 0.63 | 1.44 | 0.32 | 0.32 |
| 19.60000000000017 | 0.63 | 1.44 | 0.32 | 0.32 |
| 19.616666666666834 | 0.63 | 1.44 | 0.32 | 0.32 |
| 19.6333333333335 | 0.63 | 1.44 | 0.32 | 0.32 |
| 19.650000000000166 | 0.63 | 1.44 | 0.32 | 0.32 |
| 19.66666666666683 | 0.63 | 1.44 | 0.32 | 0.32 |
| 19.683333333333497 | 0.63 | 1.44 | 0.32 | 0.32 |
| 19.700000000000163 | 0.63 | 1.44 | 0.32 | 0.32 |
| 19.71666666666683 | 0.63 | 1.44 | 0.32 | 0.32 |
| 19.733333333333494 | 0.63 | 1.44 | 0.32 | 0.32 |
| 19.75000000000016 | 0.63 | 1.44 | 0.32 | 0.32 |
| 19.766666666666826 | 0.63 | 1.44 | 0.32 | 0.32 |
| 19.78333333333349 | 0.63 | 1.44 | 0.32 | 0.32 |
| 19.800000000000157 | 0.63 | 1.44 | 0.32 | 0.32 |
| 19.816666666666823 | 0.63 | 1.44 | 0.32 | 0.32 |
| 19.83333333333349 | 0.63 | 1.44 | 0.32 | 0.32 |
| 19.850000000000154 | 0.63 | 1.44 | 0.32 | 0.32 |
| 19.86666666666682 | 0.63 | 1.44 | 0.32 | 0.32 |
| 19.883333333333486 | 0.63 | 1.44 | 0.32 | 0.32 |
| 19.90000000000015 | 0.63 | 1.44 | 0.32 | 0.32 |
| 19.916666666666817 | 0.63 | 1.44 | 0.32 | 0.32 |
| 19.933333333333483 | 0.63 | 1.44 | 0.32 | 0.32 |
| 19.95000000000015 | 0.63 | 1.44 | 0.32 | 0.32 |
| 19.966666666666814 | 0.63 | 1.44 | 0.32 | 0.32 |
| 19.98333333333348 | 0.63 | 1.44 | 0.32 | 0.32 |
| 20.000000000000146 | 0.69 | 1.44 | 0.34 | 0.34 |
| 20.01666666666681 | 0.9 | 1.44 | 0.45 | 0.45 |
| 20.033333333333477 | 1.09 | 1.44 | 0.54 | 0.54 |
| 20.050000000000143 | 1.21 | 1.44 | 0.61 | 0.61 |
| 20.06666666666681 | 1.28 | 1.44 | 0.64 | 0.64 |
| 20.083333333333474 | 1.33 | 1.44 | 0.66 | 0.66 |
| 20.10000000000014 | 1.35 | 1.44 | 0.67 | 0.67 |
| 20.116666666666806 | 1.35 | 1.44 | 0.67 | 0.67 |
| 20.13333333333347 | 1.35 | 1.44 | 0.67 | 0.67 |
| 20.150000000000137 | 1.35 | 1.44 | 0.67 | 0.67 |
| 20.166666666666803 | 1.35 | 1.44 | 0.67 | 0.67 |
| 20.18333333333347 | 1.35 | 1.44 | 0.67 | 0.67 |
| 20.200000000000134 | 1.35 | 1.44 | 0.67 | 0.67 |
| 20.2166666666668 | 1.35 | 1.44 | 0.67 | 0.67 |
| 20.233333333333466 | 1.35 | 1.44 | 0.67 | 0.67 |
| 20.25000000000013 | 1.35 | 1.44 | 0.67 | 0.67 |
| 20.266666666666797 | 1.35 | 1.44 | 0.67 | 0.67 |
| 20.283333333333463 | 1.35 | 1.44 | 0.67 | 0.67 |
| 20.30000000000013 | 1.35 | 1.44 | 0.67 | 0.67 |
| 20.316666666666794 | 1.35 | 1.44 | 0.67 | 0.67 |
| 20.33333333333346 | 1.35 | 1.44 | 0.67 | 0.67 |
| 20.350000000000126 | 1.35 | 1.44 | 0.67 | 0.67 |
| 20.36666666666679 | 1.35 | 1.44 | 0.67 | 0.67 |
| 20.383333333333457 | 1.35 | 1.44 | 0.67 | 0.67 |
| 20.400000000000123 | 1.35 | 1.44 | 0.67 | 0.67 |
| 20.41666666666679 | 1.35 | 1.44 | 0.67 | 0.67 |
| 20.433333333333454 | 1.35 | 1.44 | 0.67 | 0.67 |
| 20.45000000000012 | 1.35 | 1.44 | 0.67 | 0.67 |
| 20.466666666666786 | 1.35 | 1.44 | 0.67 | 0.67 |
| 20.48333333333345 | 1.35 | 1.44 | 0.67 | 0.67 |
| 20.500000000000117 | 1.35 | 1.44 | 0.67 | 0.67 |
| 20.516666666666783 | 1.35 | 1.44 | 0.67 | 0.67 |
| 20.53333333333345 | 1.35 | 1.44 | 0.67 | 0.67 |
| 20.550000000000114 | 1.35 | 1.44 | 0.67 | 0.67 |
| 20.56666666666678 | 1.35 | 1.44 | 0.67 | 0.67 |
| 20.583333333333446 | 1.35 | 1.44 | 0.67 | 0.67 |
| 20.60000000000011 | 1.35 | 1.44 | 0.67 | 0.67 |
| 20.616666666666777 | 1.35 | 1.44 | 0.67 | 0.67 |
| 20.633333333333443 | 1.35 | 1.44 | 0.67 | 0.67 |
| 20.65000000000011 | 1.35 | 1.44 | 0.67 | 0.67 |
| 20.666666666666774 | 1.35 | 1.44 | 0.67 | 0.67 |
| 20.68333333333344 | 1.35 | 1.44 | 0.67 | 0.67 |
| 20.700000000000106 | 1.35 | 1.44 | 0.67 | 0.67 |
| 20.71666666666677 | 1.35 | 1.44 | 0.67 | 0.67 |
| 20.733333333333437 | 1.35 | 1.44 | 0.67 | 0.67 |
| 20.750000000000103 | 1.35 | 1.44 | 0.67 | 0.67 |
| 20.76666666666677 | 1.35 | 1.44 | 0.67 | 0.67 |
| 20.783333333333434 | 1.35 | 1.44 | 0.67 | 0.67 |
| 20.8000000000001 | 1.35 | 1.44 | 0.67 | 0.67 |
| 20.816666666666766 | 1.35 | 1.44 | 0.67 | 0.67 |
| 20.83333333333343 | 1.35 | 1.44 | 0.67 | 0.67 |
| 20.850000000000097 | 1.35 | 1.44 | 0.67 | 0.67 |
| 20.866666666666763 | 1.35 | 1.44 | 0.67 | 0.67 |
| 20.88333333333343 | 1.35 | 1.44 | 0.67 | 0.67 |
| 20.900000000000095 | 1.35 | 1.44 | 0.67 | 0.67 |
| 20.91666666666676 | 1.35 | 1.44 | 0.67 | 0.67 |
| 20.933333333333426 | 1.35 | 1.44 | 0.67 | 0.67 |
| 20.95000000000009 | 1.35 | 1.44 | 0.67 | 0.67 |
| 20.966666666666757 | 1.35 | 1.44 | 0.67 | 0.67 |
| 20.983333333333423 | 1.35 | 1.44 | 0.67 | 0.67 |
| 21.00000000000009 | 1.33 | 1.44 | 0.67 | 0.67 |
| 21.016666666666755 | 1.17 | 1.44 | 0.59 | 0.59 |
| 21.03333333333342 | 1.07 | 1.44 | 0.54 | 0.54 |
| 21.050000000000086 | 1.01 | 1.44 | 0.51 | 0.51 |
| 21.06666666666675 | 0.97 | 1.44 | 0.48 | 0.48 |
| 21.083333333333417 | 0.94 | 1.44 | 0.47 | 0.47 |
| 21.100000000000083 | 0.93 | 1.44 | 0.47 | 0.47 |
| 21.11666666666675 | 0.93 | 1.44 | 0.47 | 0.47 |
| 21.133333333333415 | 0.93 | 1.44 | 0.46 | 0.46 |
| 21.15000000000008 | 0.93 | 1.44 | 0.46 | 0.46 |
| 21.166666666666746 | 0.93 | 1.44 | 0.46 | 0.46 |
| 21.18333333333341 | 0.93 | 1.44 | 0.46 | 0.46 |
| 21.200000000000077 | 0.93 | 1.44 | 0.46 | 0.46 |
| 21.216666666666743 | 0.93 | 1.44 | 0.46 | 0.46 |
| 21.23333333333341 | 0.93 | 1.44 | 0.46 | 0.46 |
| 21.250000000000075 | 0.93 | 1.44 | 0.46 | 0.46 |
| 21.26666666666674 | 0.93 | 1.44 | 0.46 | 0.46 |
| 21.283333333333406 | 0.93 | 1.44 | 0.46 | 0.46 |
| 21.30000000000007 | 0.93 | 1.44 | 0.46 | 0.46 |
| 21.316666666666737 | 0.93 | 1.44 | 0.46 | 0.46 |
| 21.333333333333403 | 0.93 | 1.44 | 0.46 | 0.46 |
| 21.35000000000007 | 0.93 | 1.44 | 0.46 | 0.46 |
| 21.366666666666735 | 0.93 | 1.44 | 0.46 | 0.46 |
| 21.3833333333334 | 0.93 | 1.44 | 0.46 | 0.46 |
| 21.400000000000066 | 0.93 | 1.44 | 0.46 | 0.46 |
| 21.416666666666732 | 0.93 | 1.44 | 0.46 | 0.46 |
| 21.433333333333398 | 0.93 | 1.44 | 0.46 | 0.46 |
| 21.450000000000063 | 0.93 | 1.44 | 0.46 | 0.46 |
| 21.46666666666673 | 0.93 | 1.44 | 0.46 | 0.46 |
| 21.483333333333395 | 0.93 | 1.44 | 0.46 | 0.46 |
| 21.50000000000006 | 0.93 | 1.44 | 0.46 | 0.46 |
| 21.516666666666726 | 0.93 | 1.44 | 0.46 | 0.46 |
| 21.533333333333392 | 0.93 | 1.44 | 0.46 | 0.46 |
| 21.550000000000058 | 0.93 | 1.44 | 0.46 | 0.46 |
| 21.566666666666723 | 0.93 | 1.44 | 0.46 | 0.46 |
| 21.58333333333339 | 0.93 | 1.44 | 0.46 | 0.46 |
| 21.600000000000055 | 0.93 | 1.44 | 0.46 | 0.46 |
| 21.61666666666672 | 0.93 | 1.44 | 0.46 | 0.46 |
| 21.633333333333386 | 0.93 | 1.44 | 0.46 | 0.46 |
| 21.650000000000052 | 0.93 | 1.44 | 0.46 | 0.46 |
| 21.666666666666718 | 0.93 | 1.44 | 0.46 | 0.46 |
| 21.683333333333383 | 0.93 | 1.44 | 0.46 | 0.46 |
| 21.70000000000005 | 0.93 | 1.44 | 0.46 | 0.46 |
| 21.716666666666715 | 0.93 | 1.44 | 0.46 | 0.46 |
| 21.73333333333338 | 0.93 | 1.44 | 0.46 | 0.46 |
| 21.750000000000046 | 0.93 | 1.44 | 0.46 | 0.46 |
| 21.766666666666712 | 0.93 | 1.44 | 0.46 | 0.46 |
| 21.783333333333378 | 0.93 | 1.44 | 0.46 | 0.46 |
| 21.800000000000043 | 0.93 | 1.44 | 0.46 | 0.46 |
| 21.81666666666671 | 0.93 | 1.44 | 0.46 | 0.46 |
| 21.833333333333375 | 0.93 | 1.44 | 0.46 | 0.46 |
| 21.85000000000004 | 0.93 | 1.44 | 0.46 | 0.46 |
| 21.866666666666706 | 0.93 | 1.44 | 0.46 | 0.46 |
| 21.883333333333372 | 0.93 | 1.44 | 0.46 | 0.46 |
| 21.900000000000038 | 0.93 | 1.44 | 0.46 | 0.46 |
| 21.916666666666703 | 0.93 | 1.44 | 0.46 | 0.46 |
| 21.93333333333337 | 0.93 | 1.44 | 0.46 | 0.46 |
| 21.950000000000035 | 0.93 | 1.44 | 0.46 | 0.46 |
| 21.9666666666667 | 0.93 | 1.44 | 0.46 | 0.46 |
| 21.983333333333366 | 0.93 | 1.44 | 0.46 | 0.46 |
| 22.000000000000032 | 0.9 | 1.44 | 0.45 | 0.45 |
| 22.016666666666698 | 0.83 | 1.44 | 0.42 | 0.42 |
| 22.033333333333363 | 0.78 | 1.44 | 0.39 | 0.39 |
| 22.05000000000003 | 0.75 | 1.44 | 0.37 | 0.37 |
| 22.066666666666695 | 0.72 | 1.44 | 0.36 | 0.36 |
| 22.08333333333336 | 0.71 | 1.44 | 0.35 | 0.35 |
| 22.100000000000026 | 0.7 | 1.44 | 0.35 | 0.35 |
| 22.116666666666692 | 0.7 | 1.44 | 0.35 | 0.35 |
| 22.133333333333358 | 0.7 | 1.44 | 0.35 | 0.35 |
| 22.150000000000023 | 0.7 | 1.44 | 0.35 | 0.35 |
| 22.16666666666669 | 0.7 | 1.44 | 0.35 | 0.35 |
| 22.183333333333355 | 0.7 | 1.44 | 0.35 | 0.35 |
| 22.20000000000002 | 0.7 | 1.44 | 0.35 | 0.35 |
| 22.216666666666686 | 0.7 | 1.44 | 0.35 | 0.35 |
| 22.233333333333352 | 0.7 | 1.44 | 0.35 | 0.35 |
| 22.250000000000018 | 0.7 | 1.44 | 0.35 | 0.35 |
| 22.266666666666683 | 0.7 | 1.44 | 0.35 | 0.35 |
| 22.28333333333335 | 0.7 | 1.44 | 0.35 | 0.35 |
| 22.300000000000015 | 0.7 | 1.44 | 0.35 | 0.35 |
| 22.31666666666668 | 0.7 | 1.44 | 0.35 | 0.35 |
| 22.333333333333346 | 0.7 | 1.44 | 0.35 | 0.35 |
| 22.350000000000012 | 0.7 | 1.44 | 0.35 | 0.35 |
| 22.366666666666678 | 0.7 | 1.44 | 0.35 | 0.35 |
| 22.383333333333344 | 0.7 | 1.44 | 0.35 | 0.35 |
| 22.40000000000001 | 0.7 | 1.44 | 0.35 | 0.35 |
| 22.416666666666675 | 0.7 | 1.44 | 0.35 | 0.35 |
| 22.43333333333334 | 0.7 | 1.44 | 0.35 | 0.35 |
| 22.450000000000006 | 0.7 | 1.44 | 0.35 | 0.35 |
| 22.466666666666672 | 0.7 | 1.44 | 0.35 | 0.35 |
| 22.483333333333338 | 0.7 | 1.44 | 0.35 | 0.35 |
| 22.500000000000004 | 0.7 | 1.44 | 0.35 | 0.35 |
| 22.51666666666667 | 0.7 | 1.44 | 0.35 | 0.35 |
| 22.533333333333335 | 0.7 | 1.44 | 0.35 | 0.35 |
| 22.55 | 0.7 | 1.44 | 0.35 | 0.35 |
| 22.566666666666666 | 0.7 | 1.44 | 0.35 | 0.35 |
| 22.583333333333332 | 0.7 | 1.44 | 0.35 | 0.35 |
| 22.599999999999998 | 0.7 | 1.44 | 0.35 | 0.35 |
| 22.616666666666664 | 0.7 | 1.44 | 0.35 | 0.35 |
| 22.63333333333333 | 0.7 | 1.44 | 0.35 | 0.35 |
| 22.649999999999995 | 0.7 | 1.44 | 0.35 | 0.35 |
| 22.66666666666666 | 0.7 | 1.44 | 0.35 | 0.35 |
| 22.683333333333326 | 0.7 | 1.44 | 0.35 | 0.35 |
| 22.699999999999992 | 0.7 | 1.44 | 0.35 | 0.35 |
| 22.716666666666658 | 0.7 | 1.44 | 0.35 | 0.35 |
| 22.733333333333324 | 0.7 | 1.44 | 0.35 | 0.35 |
| 22.74999999999999 | 0.7 | 1.44 | 0.35 | 0.35 |
| 22.766666666666655 | 0.7 | 1.44 | 0.35 | 0.35 |
| 22.78333333333332 | 0.7 | 1.44 | 0.35 | 0.35 |
| 22.799999999999986 | 0.7 | 1.44 | 0.35 | 0.35 |
| 22.816666666666652 | 0.7 | 1.44 | 0.35 | 0.35 |
| 22.833333333333318 | 0.7 | 1.44 | 0.35 | 0.35 |
| 22.849999999999984 | 0.7 | 1.44 | 0.35 | 0.35 |
| 22.86666666666665 | 0.7 | 1.44 | 0.35 | 0.35 |
| 22.883333333333315 | 0.7 | 1.44 | 0.35 | 0.35 |
| 22.89999999999998 | 0.7 | 1.44 | 0.35 | 0.35 |
| 22.916666666666647 | 0.7 | 1.44 | 0.35 | 0.35 |
| 22.933333333333312 | 0.7 | 1.44 | 0.35 | 0.35 |
| 22.949999999999978 | 0.7 | 1.44 | 0.35 | 0.35 |
| 22.966666666666644 | 0.7 | 1.44 | 0.35 | 0.35 |
| 22.98333333333331 | 0.7 | 1.44 | 0.35 | 0.35 |
| 22.999999999999975 | 0.67 | 1.44 | 0.33 | 0.33 |
| 23.01666666666664 | 0.59 | 1.44 | 0.29 | 0.29 |
| 23.033333333333307 | 0.52 | 1.44 | 0.26 | 0.26 |
| 23.049999999999972 | 0.47 | 1.44 | 0.24 | 0.24 |
| 23.066666666666638 | 0.43 | 1.44 | 0.22 | 0.22 |
| 23.083333333333304 | 0.41 | 1.44 | 0.2 | 0.2 |
| 23.09999999999997 | 0.39 | 1.44 | 0.19 | 0.19 |
| 23.116666666666635 | 0.37 | 1.44 | 0.19 | 0.19 |
| 23.1333333333333 | 0.36 | 1.44 | 0.18 | 0.18 |
| 23.149999999999967 | 0.36 | 1.44 | 0.18 | 0.18 |
| 23.166666666666632 | 0.35 | 1.44 | 0.18 | 0.18 |
| 23.183333333333298 | 0.35 | 1.44 | 0.17 | 0.17 |
| 23.199999999999964 | 0.35 | 1.44 | 0.17 | 0.17 |
| 23.21666666666663 | 0.35 | 1.44 | 0.17 | 0.17 |
| 23.233333333333295 | 0.35 | 1.44 | 0.17 | 0.17 |
| 23.24999999999996 | 0.35 | 1.44 | 0.17 | 0.17 |
| 23.266666666666627 | 0.35 | 1.44 | 0.17 | 0.17 |
| 23.283333333333292 | 0.35 | 1.44 | 0.17 | 0.17 |
| 23.299999999999958 | 0.35 | 1.44 | 0.17 | 0.17 |
| 23.316666666666624 | 0.35 | 1.44 | 0.17 | 0.17 |
| 23.33333333333329 | 0.35 | 1.44 | 0.17 | 0.17 |
| 23.349999999999955 | 0.35 | 1.44 | 0.17 | 0.17 |
| 23.36666666666662 | 0.35 | 1.44 | 0.17 | 0.17 |
| 23.383333333333287 | 0.35 | 1.44 | 0.17 | 0.17 |
| 23.399999999999952 | 0.35 | 1.44 | 0.17 | 0.17 |
| 23.416666666666618 | 0.35 | 1.44 | 0.17 | 0.17 |
| 23.433333333333284 | 0.35 | 1.44 | 0.17 | 0.17 |
| 23.44999999999995 | 0.35 | 1.44 | 0.17 | 0.17 |
| 23.466666666666615 | 0.35 | 1.44 | 0.17 | 0.17 |
| 23.48333333333328 | 0.35 | 1.44 | 0.17 | 0.17 |
| 23.499999999999947 | 0.35 | 1.44 | 0.17 | 0.17 |
| 23.516666666666612 | 0.35 | 1.44 | 0.17 | 0.17 |
| 23.533333333333278 | 0.35 | 1.44 | 0.17 | 0.17 |
| 23.549999999999944 | 0.35 | 1.44 | 0.17 | 0.17 |
| 23.56666666666661 | 0.35 | 1.44 | 0.17 | 0.17 |
| 23.583333333333275 | 0.35 | 1.44 | 0.17 | 0.17 |
| 23.59999999999994 | 0.35 | 1.44 | 0.17 | 0.17 |
| 23.616666666666607 | 0.35 | 1.44 | 0.17 | 0.17 |
| 23.633333333333272 | 0.35 | 1.44 | 0.17 | 0.17 |
| 23.649999999999938 | 0.35 | 1.44 | 0.17 | 0.17 |
| 23.666666666666604 | 0.35 | 1.44 | 0.17 | 0.17 |
| 23.68333333333327 | 0.35 | 1.44 | 0.17 | 0.17 |
| 23.699999999999935 | 0.35 | 1.44 | 0.17 | 0.17 |
| 23.7166666666666 | 0.35 | 1.44 | 0.17 | 0.17 |
| 23.733333333333267 | 0.35 | 1.44 | 0.17 | 0.17 |
| 23.749999999999932 | 0.35 | 1.44 | 0.17 | 0.17 |
| 23.766666666666598 | 0.35 | 1.44 | 0.17 | 0.17 |
| 23.783333333333264 | 0.35 | 1.44 | 0.17 | 0.17 |
| 23.79999999999993 | 0.35 | 1.44 | 0.17 | 0.17 |
| 23.816666666666595 | 0.35 | 1.44 | 0.17 | 0.17 |
| 23.83333333333326 | 0.35 | 1.44 | 0.17 | 0.17 |
| 23.849999999999927 | 0.35 | 1.44 | 0.17 | 0.17 |
| 23.866666666666593 | 0.35 | 1.44 | 0.17 | 0.17 |
| 23.88333333333326 | 0.35 | 1.44 | 0.17 | 0.17 |
| 23.899999999999924 | 0.35 | 1.44 | 0.17 | 0.17 |
| 23.91666666666659 | 0.35 | 1.44 | 0.17 | 0.17 |
| 23.933333333333255 | 0.35 | 1.44 | 0.17 | 0.17 |
| 23.94999999999992 | 0.35 | 1.44 | 0.17 | 0.17 |
| 23.966666666666587 | 0.35 | 1.44 | 0.17 | 0.17 |
| 23.983333333333253 | 0.35 | 1.44 | 0.17 | 0.17 |
| 23.99999999999992 | 0.35 | 1.44 | 0.17 | 0.17 |
| 24.016666666666584 | 0.38 | 1.44 | 0.19 | 0.19 |
| 24.03333333333325 | 0.42 | 1.44 | 0.21 | 0.21 |
| 24.049999999999915 | 0.45 | 1.44 | 0.23 | 0.23 |
| 24.06666666666658 | 0.48 | 1.44 | 0.24 | 0.24 |
| 24.083333333333247 | 0.5 | 1.44 | 0.25 | 0.25 |
| 24.099999999999913 | 0.51 | 1.44 | 0.26 | 0.26 |
| 24.11666666666658 | 0.52 | 1.44 | 0.26 | 0.26 |
| 24.133333333333244 | 0.52 | 1.44 | 0.26 | 0.26 |
| 24.14999999999991 | 0.52 | 1.44 | 0.26 | 0.26 |
| 24.166666666666575 | 0.52 | 1.44 | 0.26 | 0.26 |
| 24.18333333333324 | 0.52 | 1.44 | 0.26 | 0.26 |
| 24.199999999999907 | 0.52 | 1.44 | 0.26 | 0.26 |
| 24.216666666666573 | 0.52 | 1.44 | 0.26 | 0.26 |
| 24.23333333333324 | 0.52 | 1.44 | 0.26 | 0.26 |
| 24.249999999999904 | 0.52 | 1.44 | 0.26 | 0.26 |
| 24.26666666666657 | 0.52 | 1.44 | 0.26 | 0.26 |
| 24.283333333333236 | 0.52 | 1.44 | 0.26 | 0.26 |
| 24.2999999999999 | 0.52 | 1.44 | 0.26 | 0.26 |
| 24.316666666666567 | 0.52 | 1.44 | 0.26 | 0.26 |
| 24.333333333333233 | 0.52 | 1.44 | 0.26 | 0.26 |
| 24.3499999999999 | 0.52 | 1.44 | 0.26 | 0.26 |
| 24.366666666666564 | 0.52 | 1.44 | 0.26 | 0.26 |
| 24.38333333333323 | 0.52 | 1.44 | 0.26 | 0.26 |
| 24.399999999999896 | 0.52 | 1.44 | 0.26 | 0.26 |
| 24.41666666666656 | 0.52 | 1.44 | 0.26 | 0.26 |
| 24.433333333333227 | 0.52 | 1.44 | 0.26 | 0.26 |
| 24.449999999999893 | 0.52 | 1.44 | 0.26 | 0.26 |
| 24.46666666666656 | 0.52 | 1.44 | 0.26 | 0.26 |
| 24.483333333333224 | 0.52 | 1.44 | 0.26 | 0.26 |
| 24.49999999999989 | 0.52 | 1.44 | 0.26 | 0.26 |
| 24.516666666666556 | 0.52 | 1.44 | 0.26 | 0.26 |
| 24.53333333333322 | 0.52 | 1.44 | 0.26 | 0.26 |
| 24.549999999999887 | 0.52 | 1.44 | 0.26 | 0.26 |
| 24.566666666666553 | 0.52 | 1.44 | 0.26 | 0.26 |
| 24.58333333333322 | 0.52 | 1.44 | 0.26 | 0.26 |
| 24.599999999999884 | 0.52 | 1.44 | 0.26 | 0.26 |
| 24.61666666666655 | 0.52 | 1.44 | 0.26 | 0.26 |
| 24.633333333333216 | 0.52 | 1.44 | 0.26 | 0.26 |
| 24.64999999999988 | 0.52 | 1.44 | 0.26 | 0.26 |
| 24.666666666666547 | 0.52 | 1.44 | 0.26 | 0.26 |
| 24.683333333333213 | 0.52 | 1.44 | 0.26 | 0.26 |
| 24.69999999999988 | 0.52 | 1.44 | 0.26 | 0.26 |
| 24.716666666666544 | 0.52 | 1.44 | 0.26 | 0.26 |
| 24.73333333333321 | 0.52 | 1.44 | 0.26 | 0.26 |
| 24.749999999999876 | 0.52 | 1.44 | 0.26 | 0.26 |
| 24.76666666666654 | 0.52 | 1.44 | 0.26 | 0.26 |
| 24.783333333333207 | 0.52 | 1.44 | 0.26 | 0.26 |
| 24.799999999999873 | 0.52 | 1.44 | 0.26 | 0.26 |
| 24.81666666666654 | 0.52 | 1.44 | 0.26 | 0.26 |
| 24.833333333333204 | 0.52 | 1.44 | 0.26 | 0.26 |
| 24.84999999999987 | 0.52 | 1.44 | 0.26 | 0.26 |
| 24.866666666666536 | 0.52 | 1.44 | 0.26 | 0.26 |
| 24.8833333333332 | 0.52 | 1.44 | 0.26 | 0.26 |
| 24.899999999999867 | 0.52 | 1.44 | 0.26 | 0.26 |
| 24.916666666666533 | 0.52 | 1.44 | 0.26 | 0.26 |
| 24.9333333333332 | 0.52 | 1.44 | 0.26 | 0.26 |
| 24.949999999999864 | 0.52 | 1.44 | 0.26 | 0.26 |
| 24.96666666666653 | 0.52 | 1.44 | 0.26 | 0.26 |
| 24.983333333333196 | 0.52 | 1.44 | 0.26 | 0.26 |
| 24.99999999999986 | 0.51 | 1.44 | 0.25 | 0.25 |